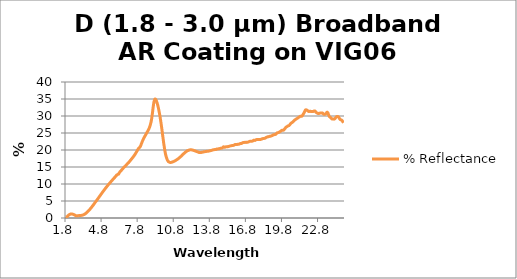
| Category | % Reflectance |
|---|---|
| 1.8 | 0.269 |
| 1.8045 | 0.246 |
| 1.809 | 0.23 |
| 1.8135 | 0.203 |
| 1.818 | 0.142 |
| 1.8225 | 0.19 |
| 1.827 | 0.202 |
| 1.8315 | 0.146 |
| 1.836 | 0.175 |
| 1.8405 | 0.157 |
| 1.845 | 0.162 |
| 1.8495 | 0.163 |
| 1.854 | 0.139 |
| 1.8585 | 0.137 |
| 1.863 | 0.177 |
| 1.8675 | 0.173 |
| 1.872 | 0.151 |
| 1.8765 | 0.161 |
| 1.881 | 0.18 |
| 1.8855 | 0.172 |
| 1.89 | 0.17 |
| 1.8945 | 0.207 |
| 1.899 | 0.196 |
| 1.9035 | 0.194 |
| 1.908 | 0.227 |
| 1.9125 | 0.238 |
| 1.917 | 0.249 |
| 1.9215 | 0.283 |
| 1.926 | 0.233 |
| 1.9305 | 0.287 |
| 1.935 | 0.289 |
| 1.9395 | 0.326 |
| 1.944 | 0.328 |
| 1.9485 | 0.32 |
| 1.953 | 0.35 |
| 1.9575 | 0.35 |
| 1.962 | 0.35 |
| 1.9665 | 0.393 |
| 1.971 | 0.374 |
| 1.9755 | 0.405 |
| 1.98 | 0.412 |
| 1.9845 | 0.457 |
| 1.989 | 0.466 |
| 1.9935 | 0.461 |
| 1.998 | 0.51 |
| 2.0025 | 0.484 |
| 2.007 | 0.537 |
| 2.0115 | 0.556 |
| 2.016 | 0.57 |
| 2.0205 | 0.574 |
| 2.025 | 0.58 |
| 2.0295 | 0.628 |
| 2.034 | 0.645 |
| 2.0385 | 0.635 |
| 2.043 | 0.642 |
| 2.0475 | 0.648 |
| 2.052 | 0.684 |
| 2.0565 | 0.692 |
| 2.061 | 0.726 |
| 2.0655 | 0.741 |
| 2.07 | 0.725 |
| 2.0745 | 0.766 |
| 2.079 | 0.773 |
| 2.0835 | 0.787 |
| 2.088 | 0.795 |
| 2.0925 | 0.802 |
| 2.097 | 0.839 |
| 2.1015 | 0.832 |
| 2.106 | 0.858 |
| 2.1105 | 0.875 |
| 2.115 | 0.866 |
| 2.1195 | 0.893 |
| 2.124 | 0.911 |
| 2.1285 | 0.929 |
| 2.133 | 0.931 |
| 2.1375 | 0.933 |
| 2.142 | 0.954 |
| 2.1465 | 0.954 |
| 2.151 | 0.953 |
| 2.1555 | 0.983 |
| 2.16 | 0.997 |
| 2.1645 | 1.018 |
| 2.169 | 1.021 |
| 2.1735 | 1.027 |
| 2.178 | 1.04 |
| 2.1825 | 1.035 |
| 2.187 | 1.06 |
| 2.1915 | 1.06 |
| 2.196 | 1.069 |
| 2.2005 | 1.071 |
| 2.205 | 1.08 |
| 2.2095 | 1.076 |
| 2.214 | 1.089 |
| 2.2185 | 1.103 |
| 2.223 | 1.116 |
| 2.2275 | 1.128 |
| 2.232 | 1.138 |
| 2.2365 | 1.13 |
| 2.241 | 1.118 |
| 2.2455 | 1.135 |
| 2.25 | 1.143 |
| 2.2545 | 1.139 |
| 2.259 | 1.137 |
| 2.2635 | 1.148 |
| 2.268 | 1.17 |
| 2.2725 | 1.159 |
| 2.277 | 1.155 |
| 2.2815 | 1.166 |
| 2.286 | 1.164 |
| 2.2905 | 1.173 |
| 2.295 | 1.177 |
| 2.2995 | 1.183 |
| 2.304 | 1.186 |
| 2.3085 | 1.184 |
| 2.313 | 1.175 |
| 2.3175 | 1.183 |
| 2.322 | 1.19 |
| 2.3265 | 1.188 |
| 2.331 | 1.188 |
| 2.3355 | 1.186 |
| 2.34 | 1.181 |
| 2.3445 | 1.183 |
| 2.349 | 1.182 |
| 2.3535 | 1.185 |
| 2.358 | 1.179 |
| 2.3625 | 1.179 |
| 2.367 | 1.175 |
| 2.3715 | 1.178 |
| 2.376 | 1.158 |
| 2.3805 | 1.167 |
| 2.385 | 1.166 |
| 2.3895 | 1.171 |
| 2.394 | 1.165 |
| 2.3985 | 1.16 |
| 2.403 | 1.154 |
| 2.4075 | 1.149 |
| 2.412 | 1.145 |
| 2.4165 | 1.146 |
| 2.421 | 1.149 |
| 2.4255 | 1.126 |
| 2.43 | 1.13 |
| 2.4345 | 1.121 |
| 2.439 | 1.124 |
| 2.4435 | 1.12 |
| 2.448 | 1.112 |
| 2.4525 | 1.113 |
| 2.457 | 1.104 |
| 2.4615 | 1.095 |
| 2.466 | 1.089 |
| 2.4705 | 1.094 |
| 2.475 | 1.081 |
| 2.4795 | 1.075 |
| 2.484 | 1.066 |
| 2.4885 | 1.076 |
| 2.493 | 1.063 |
| 2.4975 | 1.052 |
| 2.502 | 1.042 |
| 2.5065 | 1.043 |
| 2.511 | 1.039 |
| 2.5155 | 1.021 |
| 2.52 | 1.005 |
| 2.5245 | 1.019 |
| 2.529 | 1.015 |
| 2.5335 | 0.999 |
| 2.538 | 1.015 |
| 2.5425 | 0.996 |
| 2.547 | 0.977 |
| 2.5515 | 0.971 |
| 2.556 | 0.971 |
| 2.5605 | 0.956 |
| 2.565 | 0.952 |
| 2.5695 | 0.943 |
| 2.574 | 0.939 |
| 2.5785 | 0.927 |
| 2.583 | 0.921 |
| 2.5875 | 0.91 |
| 2.592 | 0.896 |
| 2.5965 | 0.89 |
| 2.601 | 0.893 |
| 2.6055 | 0.88 |
| 2.61 | 0.875 |
| 2.6145 | 0.853 |
| 2.619 | 0.838 |
| 2.6235 | 0.828 |
| 2.628 | 0.842 |
| 2.6325 | 0.832 |
| 2.637 | 0.806 |
| 2.6415 | 0.803 |
| 2.646 | 0.789 |
| 2.6505 | 0.782 |
| 2.655 | 0.78 |
| 2.6595 | 0.765 |
| 2.664 | 0.761 |
| 2.6685 | 0.748 |
| 2.673 | 0.737 |
| 2.6775 | 0.716 |
| 2.682 | 0.709 |
| 2.6865 | 0.704 |
| 2.691 | 0.694 |
| 2.6955 | 0.682 |
| 2.7 | 0.677 |
| 2.7045 | 0.663 |
| 2.709 | 0.652 |
| 2.7135 | 0.646 |
| 2.718 | 0.637 |
| 2.7225 | 0.653 |
| 2.727 | 0.647 |
| 2.7315 | 0.656 |
| 2.736 | 0.652 |
| 2.7405 | 0.66 |
| 2.745 | 0.666 |
| 2.7495 | 0.654 |
| 2.754 | 0.657 |
| 2.7585 | 0.674 |
| 2.763 | 0.662 |
| 2.7675 | 0.674 |
| 2.772 | 0.674 |
| 2.7765 | 0.658 |
| 2.781 | 0.665 |
| 2.7855 | 0.667 |
| 2.79 | 0.661 |
| 2.7945 | 0.662 |
| 2.799 | 0.665 |
| 2.8035 | 0.656 |
| 2.808 | 0.653 |
| 2.8125 | 0.655 |
| 2.817 | 0.653 |
| 2.8215 | 0.655 |
| 2.826 | 0.663 |
| 2.8305 | 0.656 |
| 2.835 | 0.653 |
| 2.8395 | 0.659 |
| 2.844 | 0.659 |
| 2.8485 | 0.665 |
| 2.853 | 0.662 |
| 2.8575 | 0.67 |
| 2.862 | 0.669 |
| 2.8665 | 0.667 |
| 2.871 | 0.679 |
| 2.8755 | 0.663 |
| 2.88 | 0.677 |
| 2.8845 | 0.678 |
| 2.889 | 0.686 |
| 2.8935 | 0.681 |
| 2.898 | 0.688 |
| 2.9025 | 0.683 |
| 2.907 | 0.688 |
| 2.9115 | 0.684 |
| 2.916 | 0.697 |
| 2.9205 | 0.693 |
| 2.925 | 0.694 |
| 2.9295 | 0.687 |
| 2.934 | 0.699 |
| 2.9385 | 0.702 |
| 2.943 | 0.698 |
| 2.9475 | 0.701 |
| 2.952 | 0.703 |
| 2.9565 | 0.704 |
| 2.961 | 0.695 |
| 2.9655 | 0.702 |
| 2.97 | 0.706 |
| 2.9745 | 0.707 |
| 2.979 | 0.705 |
| 2.9835 | 0.708 |
| 2.988 | 0.718 |
| 2.9925 | 0.717 |
| 2.997 | 0.704 |
| 3.0015 | 0.719 |
| 3.006 | 0.714 |
| 3.0105 | 0.717 |
| 3.015 | 0.715 |
| 3.0195 | 0.724 |
| 3.024 | 0.716 |
| 3.0285 | 0.716 |
| 3.033 | 0.72 |
| 3.0375 | 0.724 |
| 3.042 | 0.721 |
| 3.0465 | 0.724 |
| 3.051 | 0.734 |
| 3.0555 | 0.733 |
| 3.06 | 0.732 |
| 3.0645 | 0.736 |
| 3.069 | 0.737 |
| 3.0735 | 0.73 |
| 3.078 | 0.737 |
| 3.0825 | 0.739 |
| 3.087 | 0.743 |
| 3.0915 | 0.744 |
| 3.096 | 0.743 |
| 3.1005 | 0.754 |
| 3.105 | 0.748 |
| 3.1095 | 0.748 |
| 3.114 | 0.755 |
| 3.1185 | 0.756 |
| 3.123 | 0.761 |
| 3.1275 | 0.758 |
| 3.132 | 0.76 |
| 3.1365 | 0.76 |
| 3.141 | 0.764 |
| 3.1455 | 0.764 |
| 3.15 | 0.771 |
| 3.1545 | 0.769 |
| 3.159 | 0.774 |
| 3.1635 | 0.769 |
| 3.168 | 0.773 |
| 3.1725 | 0.769 |
| 3.177 | 0.786 |
| 3.1815 | 0.791 |
| 3.186 | 0.793 |
| 3.1905 | 0.793 |
| 3.195 | 0.8 |
| 3.1995 | 0.808 |
| 3.204 | 0.805 |
| 3.2085 | 0.809 |
| 3.213 | 0.81 |
| 3.2175 | 0.812 |
| 3.222 | 0.822 |
| 3.2265 | 0.819 |
| 3.231 | 0.828 |
| 3.2355 | 0.825 |
| 3.24 | 0.83 |
| 3.2445 | 0.837 |
| 3.249 | 0.839 |
| 3.2535 | 0.853 |
| 3.258 | 0.857 |
| 3.2625 | 0.857 |
| 3.267 | 0.858 |
| 3.2715 | 0.862 |
| 3.276 | 0.865 |
| 3.2805 | 0.878 |
| 3.285 | 0.886 |
| 3.2895 | 0.893 |
| 3.294 | 0.896 |
| 3.2985 | 0.904 |
| 3.303 | 0.906 |
| 3.3075 | 0.917 |
| 3.312 | 0.916 |
| 3.3165 | 0.927 |
| 3.321 | 0.933 |
| 3.3255 | 0.934 |
| 3.33 | 0.942 |
| 3.3345 | 0.946 |
| 3.339 | 0.955 |
| 3.3435 | 0.965 |
| 3.348 | 0.973 |
| 3.3525 | 0.985 |
| 3.357 | 0.989 |
| 3.3615 | 0.988 |
| 3.366 | 0.998 |
| 3.3705 | 1.014 |
| 3.375 | 1.014 |
| 3.3795 | 1.024 |
| 3.384 | 1.038 |
| 3.3885 | 1.041 |
| 3.393 | 1.056 |
| 3.3975 | 1.054 |
| 3.402 | 1.065 |
| 3.4065 | 1.073 |
| 3.411 | 1.075 |
| 3.4155 | 1.079 |
| 3.42 | 1.08 |
| 3.4245 | 1.089 |
| 3.429 | 1.092 |
| 3.4335 | 1.116 |
| 3.438 | 1.129 |
| 3.4425 | 1.148 |
| 3.447 | 1.163 |
| 3.4515 | 1.172 |
| 3.456 | 1.178 |
| 3.4605 | 1.188 |
| 3.465 | 1.201 |
| 3.4695 | 1.216 |
| 3.474 | 1.222 |
| 3.4785 | 1.241 |
| 3.483 | 1.256 |
| 3.4875 | 1.258 |
| 3.492 | 1.272 |
| 3.4965 | 1.281 |
| 3.501 | 1.286 |
| 3.5055 | 1.293 |
| 3.51 | 1.3 |
| 3.5145 | 1.318 |
| 3.519 | 1.342 |
| 3.5235 | 1.347 |
| 3.528 | 1.359 |
| 3.5325 | 1.385 |
| 3.537 | 1.392 |
| 3.5415 | 1.403 |
| 3.546 | 1.42 |
| 3.5505 | 1.426 |
| 3.555 | 1.441 |
| 3.5595 | 1.453 |
| 3.564 | 1.468 |
| 3.5685 | 1.484 |
| 3.573 | 1.499 |
| 3.5775 | 1.508 |
| 3.582 | 1.521 |
| 3.5865 | 1.533 |
| 3.591 | 1.551 |
| 3.5955 | 1.56 |
| 3.6 | 1.574 |
| 3.6045 | 1.592 |
| 3.609 | 1.606 |
| 3.6135 | 1.614 |
| 3.618 | 1.632 |
| 3.6225 | 1.647 |
| 3.627 | 1.665 |
| 3.6315 | 1.683 |
| 3.636 | 1.689 |
| 3.6405 | 1.701 |
| 3.645 | 1.722 |
| 3.6495 | 1.736 |
| 3.654 | 1.749 |
| 3.6585 | 1.769 |
| 3.663 | 1.788 |
| 3.6675 | 1.803 |
| 3.672 | 1.814 |
| 3.6765 | 1.829 |
| 3.681 | 1.846 |
| 3.6855 | 1.862 |
| 3.69 | 1.875 |
| 3.6945 | 1.895 |
| 3.699 | 1.905 |
| 3.7035 | 1.925 |
| 3.708 | 1.941 |
| 3.7125 | 1.954 |
| 3.717 | 1.973 |
| 3.7215 | 1.986 |
| 3.726 | 2.005 |
| 3.7305 | 2.022 |
| 3.735 | 2.036 |
| 3.7395 | 2.05 |
| 3.744 | 2.067 |
| 3.7485 | 2.085 |
| 3.753 | 2.103 |
| 3.7575 | 2.118 |
| 3.762 | 2.132 |
| 3.7665 | 2.156 |
| 3.771 | 2.181 |
| 3.7755 | 2.193 |
| 3.78 | 2.21 |
| 3.7845 | 2.231 |
| 3.789 | 2.246 |
| 3.7935 | 2.259 |
| 3.798 | 2.277 |
| 3.8025 | 2.289 |
| 3.807 | 2.307 |
| 3.8115 | 2.328 |
| 3.816 | 2.347 |
| 3.8205 | 2.367 |
| 3.825 | 2.387 |
| 3.8295 | 2.399 |
| 3.834 | 2.422 |
| 3.8385 | 2.445 |
| 3.843 | 2.461 |
| 3.8475 | 2.472 |
| 3.852 | 2.487 |
| 3.8565 | 2.509 |
| 3.861 | 2.53 |
| 3.8655 | 2.544 |
| 3.87 | 2.559 |
| 3.8745 | 2.576 |
| 3.879 | 2.6 |
| 3.8835 | 2.62 |
| 3.888 | 2.646 |
| 3.8925 | 2.662 |
| 3.897 | 2.675 |
| 3.9015 | 2.702 |
| 3.906 | 2.718 |
| 3.9105 | 2.736 |
| 3.915 | 2.755 |
| 3.9195 | 2.774 |
| 3.924 | 2.797 |
| 3.9285 | 2.816 |
| 3.933 | 2.838 |
| 3.9375 | 2.854 |
| 3.942 | 2.872 |
| 3.9465 | 2.892 |
| 3.951 | 2.912 |
| 3.9555 | 2.932 |
| 3.96 | 2.95 |
| 3.9645 | 2.967 |
| 3.969 | 2.986 |
| 3.9735 | 3.005 |
| 3.978 | 3.024 |
| 3.9825 | 3.048 |
| 3.987 | 3.068 |
| 3.9915 | 3.084 |
| 3.996 | 3.102 |
| 4.0005 | 3.128 |
| 4.005 | 3.154 |
| 4.0095 | 3.168 |
| 4.014 | 3.185 |
| 4.0185 | 3.202 |
| 4.023 | 3.225 |
| 4.0275 | 3.246 |
| 4.032 | 3.271 |
| 4.0365 | 3.284 |
| 4.041 | 3.305 |
| 4.0455 | 3.322 |
| 4.05 | 3.34 |
| 4.0545 | 3.368 |
| 4.059 | 3.39 |
| 4.0635 | 3.408 |
| 4.068 | 3.429 |
| 4.0725 | 3.451 |
| 4.077 | 3.469 |
| 4.0815 | 3.498 |
| 4.086 | 3.518 |
| 4.0905 | 3.532 |
| 4.095 | 3.552 |
| 4.0995 | 3.575 |
| 4.104 | 3.595 |
| 4.1085 | 3.618 |
| 4.113 | 3.641 |
| 4.1175 | 3.657 |
| 4.122 | 3.677 |
| 4.1265 | 3.7 |
| 4.131 | 3.725 |
| 4.1355 | 3.744 |
| 4.14 | 3.767 |
| 4.1445 | 3.783 |
| 4.149 | 3.8 |
| 4.1535 | 3.827 |
| 4.158 | 3.851 |
| 4.1625 | 3.874 |
| 4.167 | 3.893 |
| 4.1715 | 3.915 |
| 4.176 | 3.939 |
| 4.1805 | 3.955 |
| 4.185 | 3.972 |
| 4.1895 | 3.998 |
| 4.194 | 4.013 |
| 4.1985 | 4.039 |
| 4.203 | 4.075 |
| 4.2075 | 4.098 |
| 4.212 | 4.121 |
| 4.2165 | 4.155 |
| 4.221 | 4.158 |
| 4.2255 | 4.172 |
| 4.23 | 4.207 |
| 4.2345 | 4.221 |
| 4.239 | 4.236 |
| 4.2435 | 4.272 |
| 4.248 | 4.294 |
| 4.2525 | 4.316 |
| 4.257 | 4.338 |
| 4.2615 | 4.35 |
| 4.266 | 4.373 |
| 4.2705 | 4.407 |
| 4.275 | 4.437 |
| 4.2795 | 4.455 |
| 4.284 | 4.472 |
| 4.2885 | 4.499 |
| 4.293 | 4.514 |
| 4.2975 | 4.535 |
| 4.302 | 4.567 |
| 4.3065 | 4.581 |
| 4.311 | 4.604 |
| 4.3155 | 4.627 |
| 4.32 | 4.646 |
| 4.3245 | 4.668 |
| 4.329 | 4.689 |
| 4.3335 | 4.718 |
| 4.338 | 4.738 |
| 4.3425 | 4.757 |
| 4.347 | 4.777 |
| 4.3515 | 4.79 |
| 4.356 | 4.81 |
| 4.3605 | 4.829 |
| 4.365 | 4.85 |
| 4.3695 | 4.872 |
| 4.374 | 4.891 |
| 4.3785 | 4.908 |
| 4.383 | 4.933 |
| 4.3875 | 4.957 |
| 4.392 | 4.974 |
| 4.3965 | 5 |
| 4.401 | 5.026 |
| 4.4055 | 5.042 |
| 4.41 | 5.06 |
| 4.4145 | 5.086 |
| 4.419 | 5.112 |
| 4.4235 | 5.134 |
| 4.428 | 5.155 |
| 4.4325 | 5.177 |
| 4.437 | 5.203 |
| 4.4415 | 5.225 |
| 4.446 | 5.241 |
| 4.4505 | 5.263 |
| 4.455 | 5.289 |
| 4.4595 | 5.311 |
| 4.464 | 5.331 |
| 4.4685 | 5.355 |
| 4.473 | 5.375 |
| 4.4775 | 5.393 |
| 4.482 | 5.416 |
| 4.4865 | 5.441 |
| 4.491 | 5.459 |
| 4.4955 | 5.48 |
| 4.5 | 5.505 |
| 4.5045 | 5.529 |
| 4.509 | 5.548 |
| 4.5135 | 5.571 |
| 4.518 | 5.589 |
| 4.5225 | 5.609 |
| 4.527 | 5.635 |
| 4.5315 | 5.658 |
| 4.536 | 5.686 |
| 4.5405 | 5.712 |
| 4.545 | 5.733 |
| 4.5495 | 5.753 |
| 4.554 | 5.773 |
| 4.5585 | 5.791 |
| 4.563 | 5.81 |
| 4.5675 | 5.833 |
| 4.572 | 5.857 |
| 4.5765 | 5.879 |
| 4.581 | 5.9 |
| 4.5855 | 5.92 |
| 4.59 | 5.946 |
| 4.5945 | 5.973 |
| 4.599 | 5.998 |
| 4.6035 | 6.016 |
| 4.608 | 6.037 |
| 4.6125 | 6.061 |
| 4.617 | 6.08 |
| 4.6215 | 6.102 |
| 4.626 | 6.123 |
| 4.6305 | 6.149 |
| 4.635 | 6.173 |
| 4.6395 | 6.192 |
| 4.644 | 6.211 |
| 4.6485 | 6.235 |
| 4.653 | 6.256 |
| 4.6575 | 6.277 |
| 4.662 | 6.298 |
| 4.6665 | 6.323 |
| 4.671 | 6.348 |
| 4.6755 | 6.371 |
| 4.68 | 6.395 |
| 4.6845 | 6.42 |
| 4.689 | 6.44 |
| 4.6935 | 6.46 |
| 4.698 | 6.484 |
| 4.7025 | 6.508 |
| 4.707 | 6.531 |
| 4.7115 | 6.551 |
| 4.716 | 6.572 |
| 4.7205 | 6.597 |
| 4.725 | 6.617 |
| 4.7295 | 6.637 |
| 4.734 | 6.66 |
| 4.7385 | 6.681 |
| 4.743 | 6.702 |
| 4.7475 | 6.721 |
| 4.752 | 6.742 |
| 4.7565 | 6.77 |
| 4.761 | 6.797 |
| 4.7655 | 6.817 |
| 4.77 | 6.836 |
| 4.7745 | 6.861 |
| 4.779 | 6.884 |
| 4.7835 | 6.902 |
| 4.788 | 6.925 |
| 4.7925 | 6.948 |
| 4.797 | 6.969 |
| 4.8015 | 6.991 |
| 4.806 | 7.014 |
| 4.8105 | 7.04 |
| 4.815 | 7.061 |
| 4.8195 | 7.083 |
| 4.824 | 7.104 |
| 4.8285 | 7.124 |
| 4.833 | 7.146 |
| 4.8375 | 7.175 |
| 4.842 | 7.198 |
| 4.8465 | 7.219 |
| 4.851 | 7.24 |
| 4.8555 | 7.262 |
| 4.86 | 7.282 |
| 4.8645 | 7.304 |
| 4.869 | 7.326 |
| 4.8735 | 7.35 |
| 4.878 | 7.372 |
| 4.8825 | 7.396 |
| 4.887 | 7.421 |
| 4.8915 | 7.446 |
| 4.896 | 7.468 |
| 4.9005 | 7.49 |
| 4.905 | 7.512 |
| 4.9095 | 7.531 |
| 4.914 | 7.552 |
| 4.9185 | 7.575 |
| 4.923 | 7.598 |
| 4.9275 | 7.617 |
| 4.932 | 7.641 |
| 4.9365 | 7.663 |
| 4.941 | 7.686 |
| 4.9455 | 7.708 |
| 4.95 | 7.729 |
| 4.9545 | 7.75 |
| 4.959 | 7.772 |
| 4.9635 | 7.794 |
| 4.968 | 7.816 |
| 4.9725 | 7.837 |
| 4.977 | 7.856 |
| 4.9815 | 7.879 |
| 4.986 | 7.899 |
| 4.9905 | 7.917 |
| 4.995 | 7.936 |
| 4.9995 | 7.961 |
| 5.004 | 7.984 |
| 5.0085 | 8.001 |
| 5.013 | 8.016 |
| 5.0175 | 8.039 |
| 5.022 | 8.069 |
| 5.0265 | 8.093 |
| 5.031 | 8.113 |
| 5.0355 | 8.133 |
| 5.04 | 8.155 |
| 5.0445 | 8.175 |
| 5.049 | 8.199 |
| 5.0535 | 8.223 |
| 5.058 | 8.243 |
| 5.0625 | 8.262 |
| 5.067 | 8.281 |
| 5.0715 | 8.301 |
| 5.076 | 8.319 |
| 5.0805 | 8.339 |
| 5.085 | 8.36 |
| 5.0895 | 8.38 |
| 5.094 | 8.402 |
| 5.0985 | 8.424 |
| 5.103 | 8.448 |
| 5.1075 | 8.469 |
| 5.112 | 8.489 |
| 5.1165 | 8.507 |
| 5.121 | 8.523 |
| 5.1255 | 8.543 |
| 5.13 | 8.568 |
| 5.1345 | 8.595 |
| 5.139 | 8.618 |
| 5.1435 | 8.639 |
| 5.148 | 8.655 |
| 5.1525 | 8.672 |
| 5.157 | 8.691 |
| 5.1615 | 8.709 |
| 5.166 | 8.727 |
| 5.1705 | 8.747 |
| 5.175 | 8.77 |
| 5.1795 | 8.792 |
| 5.184 | 8.815 |
| 5.1885 | 8.839 |
| 5.193 | 8.857 |
| 5.1975 | 8.877 |
| 5.202 | 8.897 |
| 5.2065 | 8.92 |
| 5.211 | 8.944 |
| 5.2155 | 8.964 |
| 5.22 | 8.984 |
| 5.2245 | 9.005 |
| 5.229 | 9.024 |
| 5.2335 | 9.042 |
| 5.238 | 9.06 |
| 5.2425 | 9.081 |
| 5.247 | 9.104 |
| 5.2515 | 9.127 |
| 5.256 | 9.147 |
| 5.2605 | 9.166 |
| 5.265 | 9.188 |
| 5.2695 | 9.212 |
| 5.274 | 9.234 |
| 5.2785 | 9.253 |
| 5.283 | 9.271 |
| 5.2875 | 9.289 |
| 5.292 | 9.308 |
| 5.2965 | 9.328 |
| 5.301 | 9.348 |
| 5.3055 | 9.371 |
| 5.31 | 9.392 |
| 5.3145 | 9.406 |
| 5.319 | 9.422 |
| 5.3235 | 9.445 |
| 5.328 | 9.469 |
| 5.3325 | 9.489 |
| 5.337 | 9.504 |
| 5.3415 | 9.523 |
| 5.346 | 9.544 |
| 5.3505 | 9.566 |
| 5.355 | 9.582 |
| 5.3595 | 9.597 |
| 5.364 | 9.622 |
| 5.3685 | 9.647 |
| 5.373 | 9.664 |
| 5.3775 | 9.679 |
| 5.382 | 9.695 |
| 5.3865 | 9.713 |
| 5.391 | 9.73 |
| 5.3955 | 9.747 |
| 5.4 | 9.768 |
| 5.4045 | 9.789 |
| 5.409 | 9.812 |
| 5.4135 | 9.835 |
| 5.418 | 9.85 |
| 5.4225 | 9.863 |
| 5.427 | 9.877 |
| 5.4315 | 9.898 |
| 5.436 | 9.922 |
| 5.4405 | 9.94 |
| 5.445 | 9.956 |
| 5.4495 | 9.974 |
| 5.454 | 9.995 |
| 5.4585 | 10.017 |
| 5.463 | 10.035 |
| 5.4675 | 10.049 |
| 5.472 | 10.069 |
| 5.4765 | 10.091 |
| 5.481 | 10.11 |
| 5.4855 | 10.126 |
| 5.49 | 10.143 |
| 5.4945 | 10.163 |
| 5.499 | 10.184 |
| 5.5035 | 10.201 |
| 5.508 | 10.215 |
| 5.5125 | 10.229 |
| 5.517 | 10.246 |
| 5.5215 | 10.263 |
| 5.526 | 10.28 |
| 5.5305 | 10.302 |
| 5.535 | 10.323 |
| 5.5395 | 10.343 |
| 5.544 | 10.361 |
| 5.5485 | 10.378 |
| 5.553 | 10.397 |
| 5.5575 | 10.418 |
| 5.562 | 10.436 |
| 5.5665 | 10.453 |
| 5.571 | 10.472 |
| 5.5755 | 10.489 |
| 5.58 | 10.509 |
| 5.5845 | 10.531 |
| 5.589 | 10.551 |
| 5.5935 | 10.572 |
| 5.598 | 10.59 |
| 5.6025 | 10.604 |
| 5.607 | 10.617 |
| 5.6115 | 10.635 |
| 5.616 | 10.658 |
| 5.6205 | 10.68 |
| 5.625 | 10.7 |
| 5.6295 | 10.723 |
| 5.634 | 10.744 |
| 5.6385 | 10.76 |
| 5.643 | 10.774 |
| 5.6475 | 10.788 |
| 5.652 | 10.806 |
| 5.6565 | 10.826 |
| 5.661 | 10.845 |
| 5.6655 | 10.867 |
| 5.67 | 10.89 |
| 5.6745 | 10.91 |
| 5.679 | 10.924 |
| 5.6835 | 10.938 |
| 5.688 | 10.953 |
| 5.6925 | 10.973 |
| 5.697 | 10.995 |
| 5.7015 | 11.015 |
| 5.706 | 11.036 |
| 5.7105 | 11.059 |
| 5.715 | 11.078 |
| 5.7195 | 11.093 |
| 5.724 | 11.106 |
| 5.7285 | 11.121 |
| 5.733 | 11.138 |
| 5.7375 | 11.155 |
| 5.742 | 11.173 |
| 5.7465 | 11.194 |
| 5.751 | 11.214 |
| 5.7555 | 11.232 |
| 5.76 | 11.251 |
| 5.7645 | 11.268 |
| 5.769 | 11.284 |
| 5.7735 | 11.304 |
| 5.778 | 11.323 |
| 5.7825 | 11.341 |
| 5.787 | 11.36 |
| 5.7915 | 11.38 |
| 5.796 | 11.399 |
| 5.8005 | 11.419 |
| 5.805 | 11.437 |
| 5.8095 | 11.456 |
| 5.814 | 11.479 |
| 5.8185 | 11.501 |
| 5.823 | 11.516 |
| 5.8275 | 11.527 |
| 5.832 | 11.54 |
| 5.8365 | 11.56 |
| 5.841 | 11.583 |
| 5.8455 | 11.601 |
| 5.85 | 11.617 |
| 5.8545 | 11.636 |
| 5.859 | 11.655 |
| 5.8635 | 11.67 |
| 5.868 | 11.685 |
| 5.8725 | 11.7 |
| 5.877 | 11.713 |
| 5.8815 | 11.731 |
| 5.886 | 11.751 |
| 5.8905 | 11.769 |
| 5.895 | 11.788 |
| 5.8995 | 11.81 |
| 5.904 | 11.831 |
| 5.9085 | 11.852 |
| 5.913 | 11.87 |
| 5.9175 | 11.886 |
| 5.922 | 11.904 |
| 5.9265 | 11.92 |
| 5.931 | 11.928 |
| 5.9355 | 11.932 |
| 5.94 | 11.942 |
| 5.9445 | 11.966 |
| 5.949 | 11.995 |
| 5.9535 | 12.018 |
| 5.958 | 12.037 |
| 5.9625 | 12.056 |
| 5.967 | 12.079 |
| 5.9715 | 12.099 |
| 5.976 | 12.116 |
| 5.9805 | 12.132 |
| 5.985 | 12.147 |
| 5.9895 | 12.164 |
| 5.994 | 12.187 |
| 5.9985 | 12.207 |
| 6.003 | 12.224 |
| 6.0075 | 12.24 |
| 6.012 | 12.257 |
| 6.0165 | 12.273 |
| 6.021 | 12.29 |
| 6.0255 | 12.309 |
| 6.03 | 12.329 |
| 6.0345 | 12.352 |
| 6.039 | 12.375 |
| 6.0435 | 12.388 |
| 6.048 | 12.394 |
| 6.0525 | 12.409 |
| 6.057 | 12.435 |
| 6.0615 | 12.465 |
| 6.066 | 12.488 |
| 6.0705 | 12.502 |
| 6.075 | 12.513 |
| 6.0795 | 12.529 |
| 6.084 | 12.547 |
| 6.0885 | 12.563 |
| 6.093 | 12.579 |
| 6.0975 | 12.597 |
| 6.102 | 12.614 |
| 6.1065 | 12.629 |
| 6.111 | 12.641 |
| 6.1155 | 12.65 |
| 6.12 | 12.659 |
| 6.1245 | 12.673 |
| 6.129 | 12.686 |
| 6.1335 | 12.694 |
| 6.138 | 12.698 |
| 6.1425 | 12.703 |
| 6.147 | 12.705 |
| 6.1515 | 12.709 |
| 6.156 | 12.719 |
| 6.1605 | 12.735 |
| 6.165 | 12.755 |
| 6.1695 | 12.776 |
| 6.174 | 12.792 |
| 6.1785 | 12.803 |
| 6.183 | 12.813 |
| 6.1875 | 12.828 |
| 6.192 | 12.844 |
| 6.1965 | 12.857 |
| 6.201 | 12.87 |
| 6.2055 | 12.88 |
| 6.21 | 12.887 |
| 6.2145 | 12.893 |
| 6.219 | 12.901 |
| 6.2235 | 12.909 |
| 6.228 | 12.918 |
| 6.2325 | 12.927 |
| 6.237 | 12.933 |
| 6.2415 | 12.933 |
| 6.246 | 12.928 |
| 6.2505 | 12.917 |
| 6.255 | 12.904 |
| 6.2595 | 12.897 |
| 6.264 | 12.907 |
| 6.2685 | 12.936 |
| 6.273 | 12.979 |
| 6.2775 | 13.029 |
| 6.282 | 13.081 |
| 6.2865 | 13.127 |
| 6.291 | 13.167 |
| 6.2955 | 13.202 |
| 6.3 | 13.232 |
| 6.3045 | 13.258 |
| 6.309 | 13.282 |
| 6.3135 | 13.306 |
| 6.318 | 13.327 |
| 6.3225 | 13.347 |
| 6.327 | 13.368 |
| 6.3315 | 13.39 |
| 6.336 | 13.41 |
| 6.3405 | 13.429 |
| 6.345 | 13.451 |
| 6.3495 | 13.47 |
| 6.354 | 13.488 |
| 6.3585 | 13.508 |
| 6.363 | 13.527 |
| 6.3675 | 13.546 |
| 6.372 | 13.566 |
| 6.3765 | 13.586 |
| 6.381 | 13.604 |
| 6.3855 | 13.62 |
| 6.39 | 13.636 |
| 6.3945 | 13.655 |
| 6.399 | 13.674 |
| 6.4035 | 13.69 |
| 6.408 | 13.703 |
| 6.4125 | 13.72 |
| 6.417 | 13.738 |
| 6.4215 | 13.757 |
| 6.426 | 13.777 |
| 6.4305 | 13.795 |
| 6.435 | 13.812 |
| 6.4395 | 13.833 |
| 6.444 | 13.857 |
| 6.4485 | 13.879 |
| 6.453 | 13.899 |
| 6.4575 | 13.917 |
| 6.462 | 13.932 |
| 6.4665 | 13.946 |
| 6.471 | 13.961 |
| 6.4755 | 13.98 |
| 6.48 | 14.001 |
| 6.4845 | 14.019 |
| 6.489 | 14.036 |
| 6.4935 | 14.055 |
| 6.498 | 14.073 |
| 6.5025 | 14.093 |
| 6.507 | 14.119 |
| 6.5115 | 14.145 |
| 6.516 | 14.165 |
| 6.5205 | 14.179 |
| 6.525 | 14.192 |
| 6.5295 | 14.205 |
| 6.534 | 14.218 |
| 6.5385 | 14.233 |
| 6.543 | 14.25 |
| 6.5475 | 14.269 |
| 6.552 | 14.289 |
| 6.5565 | 14.311 |
| 6.561 | 14.335 |
| 6.5655 | 14.359 |
| 6.57 | 14.381 |
| 6.5745 | 14.4 |
| 6.579 | 14.414 |
| 6.5835 | 14.424 |
| 6.588 | 14.438 |
| 6.5925 | 14.459 |
| 6.597 | 14.484 |
| 6.6015 | 14.504 |
| 6.606 | 14.519 |
| 6.6105 | 14.534 |
| 6.615 | 14.552 |
| 6.6195 | 14.571 |
| 6.624 | 14.589 |
| 6.6285 | 14.608 |
| 6.633 | 14.631 |
| 6.6375 | 14.653 |
| 6.642 | 14.669 |
| 6.6465 | 14.683 |
| 6.651 | 14.698 |
| 6.6555 | 14.713 |
| 6.66 | 14.728 |
| 6.6645 | 14.745 |
| 6.669 | 14.766 |
| 6.6735 | 14.786 |
| 6.678 | 14.807 |
| 6.6825 | 14.827 |
| 6.687 | 14.846 |
| 6.6915 | 14.861 |
| 6.696 | 14.876 |
| 6.7005 | 14.891 |
| 6.705 | 14.906 |
| 6.7095 | 14.921 |
| 6.714 | 14.938 |
| 6.7185 | 14.957 |
| 6.723 | 14.973 |
| 6.7275 | 14.986 |
| 6.732 | 14.999 |
| 6.7365 | 15.014 |
| 6.741 | 15.029 |
| 6.7455 | 15.044 |
| 6.75 | 15.058 |
| 6.7545 | 15.072 |
| 6.759 | 15.087 |
| 6.7635 | 15.102 |
| 6.768 | 15.119 |
| 6.7725 | 15.138 |
| 6.777 | 15.153 |
| 6.7815 | 15.162 |
| 6.786 | 15.167 |
| 6.7905 | 15.174 |
| 6.795 | 15.183 |
| 6.7995 | 15.195 |
| 6.804 | 15.209 |
| 6.8085 | 15.225 |
| 6.813 | 15.243 |
| 6.8175 | 15.259 |
| 6.822 | 15.276 |
| 6.8265 | 15.296 |
| 6.831 | 15.317 |
| 6.8355 | 15.338 |
| 6.84 | 15.36 |
| 6.8445 | 15.382 |
| 6.849 | 15.403 |
| 6.8535 | 15.42 |
| 6.858 | 15.434 |
| 6.8625 | 15.451 |
| 6.867 | 15.474 |
| 6.8715 | 15.496 |
| 6.876 | 15.513 |
| 6.8805 | 15.529 |
| 6.885 | 15.546 |
| 6.8895 | 15.564 |
| 6.894 | 15.582 |
| 6.8985 | 15.599 |
| 6.903 | 15.616 |
| 6.9075 | 15.634 |
| 6.912 | 15.649 |
| 6.9165 | 15.663 |
| 6.921 | 15.68 |
| 6.9255 | 15.699 |
| 6.93 | 15.718 |
| 6.9345 | 15.737 |
| 6.939 | 15.755 |
| 6.9435 | 15.773 |
| 6.948 | 15.789 |
| 6.9525 | 15.804 |
| 6.957 | 15.82 |
| 6.9615 | 15.84 |
| 6.966 | 15.86 |
| 6.9705 | 15.877 |
| 6.975 | 15.893 |
| 6.9795 | 15.911 |
| 6.984 | 15.933 |
| 6.9885 | 15.955 |
| 6.993 | 15.975 |
| 6.9975 | 15.994 |
| 7.002 | 16.01 |
| 7.0065 | 16.025 |
| 7.011 | 16.04 |
| 7.0155 | 16.058 |
| 7.02 | 16.078 |
| 7.0245 | 16.097 |
| 7.029 | 16.112 |
| 7.0335 | 16.124 |
| 7.038 | 16.138 |
| 7.0425 | 16.155 |
| 7.047 | 16.171 |
| 7.0515 | 16.186 |
| 7.056 | 16.199 |
| 7.0605 | 16.212 |
| 7.065 | 16.224 |
| 7.0695 | 16.234 |
| 7.074 | 16.244 |
| 7.0785 | 16.258 |
| 7.083 | 16.276 |
| 7.0875 | 16.294 |
| 7.092 | 16.312 |
| 7.0965 | 16.33 |
| 7.101 | 16.35 |
| 7.1055 | 16.371 |
| 7.11 | 16.392 |
| 7.1145 | 16.414 |
| 7.119 | 16.436 |
| 7.1235 | 16.455 |
| 7.128 | 16.471 |
| 7.1325 | 16.486 |
| 7.137 | 16.5 |
| 7.1415 | 16.517 |
| 7.146 | 16.533 |
| 7.1505 | 16.548 |
| 7.155 | 16.562 |
| 7.1595 | 16.579 |
| 7.164 | 16.599 |
| 7.1685 | 16.618 |
| 7.173 | 16.636 |
| 7.1775 | 16.654 |
| 7.182 | 16.673 |
| 7.1865 | 16.693 |
| 7.191 | 16.714 |
| 7.1955 | 16.736 |
| 7.2 | 16.762 |
| 7.2045 | 16.788 |
| 7.209 | 16.81 |
| 7.2135 | 16.829 |
| 7.218 | 16.845 |
| 7.2225 | 16.863 |
| 7.227 | 16.885 |
| 7.2315 | 16.906 |
| 7.236 | 16.927 |
| 7.2405 | 16.948 |
| 7.245 | 16.97 |
| 7.2495 | 16.991 |
| 7.254 | 17.012 |
| 7.2585 | 17.031 |
| 7.263 | 17.053 |
| 7.2675 | 17.076 |
| 7.272 | 17.098 |
| 7.2765 | 17.117 |
| 7.281 | 17.134 |
| 7.2855 | 17.152 |
| 7.29 | 17.17 |
| 7.2945 | 17.188 |
| 7.299 | 17.205 |
| 7.3035 | 17.222 |
| 7.308 | 17.241 |
| 7.3125 | 17.262 |
| 7.317 | 17.284 |
| 7.3215 | 17.306 |
| 7.326 | 17.329 |
| 7.3305 | 17.352 |
| 7.335 | 17.373 |
| 7.3395 | 17.391 |
| 7.344 | 17.409 |
| 7.3485 | 17.427 |
| 7.353 | 17.448 |
| 7.3575 | 17.468 |
| 7.362 | 17.488 |
| 7.3665 | 17.507 |
| 7.371 | 17.528 |
| 7.3755 | 17.548 |
| 7.38 | 17.568 |
| 7.3845 | 17.586 |
| 7.389 | 17.604 |
| 7.3935 | 17.622 |
| 7.398 | 17.64 |
| 7.4025 | 17.657 |
| 7.407 | 17.675 |
| 7.4115 | 17.694 |
| 7.416 | 17.717 |
| 7.4205 | 17.741 |
| 7.425 | 17.764 |
| 7.4295 | 17.786 |
| 7.434 | 17.806 |
| 7.4385 | 17.825 |
| 7.443 | 17.843 |
| 7.4475 | 17.859 |
| 7.452 | 17.876 |
| 7.4565 | 17.896 |
| 7.461 | 17.918 |
| 7.4655 | 17.943 |
| 7.47 | 17.966 |
| 7.4745 | 17.989 |
| 7.479 | 18.011 |
| 7.4835 | 18.032 |
| 7.488 | 18.053 |
| 7.4925 | 18.071 |
| 7.497 | 18.089 |
| 7.5015 | 18.108 |
| 7.506 | 18.128 |
| 7.5105 | 18.15 |
| 7.515 | 18.171 |
| 7.5195 | 18.192 |
| 7.524 | 18.214 |
| 7.5285 | 18.236 |
| 7.533 | 18.259 |
| 7.5375 | 18.283 |
| 7.542 | 18.307 |
| 7.5465 | 18.333 |
| 7.551 | 18.359 |
| 7.5555 | 18.383 |
| 7.56 | 18.403 |
| 7.5645 | 18.421 |
| 7.569 | 18.439 |
| 7.5735 | 18.461 |
| 7.578 | 18.485 |
| 7.5825 | 18.508 |
| 7.587 | 18.531 |
| 7.5915 | 18.553 |
| 7.596 | 18.577 |
| 7.6005 | 18.601 |
| 7.605 | 18.627 |
| 7.6095 | 18.653 |
| 7.614 | 18.679 |
| 7.6185 | 18.707 |
| 7.623 | 18.733 |
| 7.6275 | 18.758 |
| 7.632 | 18.782 |
| 7.6365 | 18.806 |
| 7.641 | 18.834 |
| 7.6455 | 18.862 |
| 7.65 | 18.888 |
| 7.6545 | 18.913 |
| 7.659 | 18.936 |
| 7.6635 | 18.96 |
| 7.668 | 18.986 |
| 7.6725 | 19.012 |
| 7.677 | 19.037 |
| 7.6815 | 19.061 |
| 7.686 | 19.087 |
| 7.6905 | 19.113 |
| 7.695 | 19.139 |
| 7.6995 | 19.165 |
| 7.704 | 19.191 |
| 7.7085 | 19.218 |
| 7.713 | 19.247 |
| 7.7175 | 19.275 |
| 7.722 | 19.302 |
| 7.7265 | 19.329 |
| 7.731 | 19.356 |
| 7.7355 | 19.385 |
| 7.74 | 19.416 |
| 7.7445 | 19.446 |
| 7.749 | 19.474 |
| 7.7535 | 19.501 |
| 7.758 | 19.528 |
| 7.7625 | 19.555 |
| 7.767 | 19.581 |
| 7.7715 | 19.605 |
| 7.776 | 19.629 |
| 7.7805 | 19.653 |
| 7.785 | 19.679 |
| 7.7895 | 19.707 |
| 7.794 | 19.735 |
| 7.7985 | 19.763 |
| 7.803 | 19.792 |
| 7.8075 | 19.824 |
| 7.812 | 19.857 |
| 7.8165 | 19.889 |
| 7.821 | 19.92 |
| 7.8255 | 19.95 |
| 7.83 | 19.978 |
| 7.8345 | 20.005 |
| 7.839 | 20.032 |
| 7.8435 | 20.056 |
| 7.848 | 20.081 |
| 7.8525 | 20.106 |
| 7.857 | 20.134 |
| 7.8615 | 20.162 |
| 7.866 | 20.19 |
| 7.8705 | 20.216 |
| 7.875 | 20.241 |
| 7.8795 | 20.267 |
| 7.884 | 20.293 |
| 7.8885 | 20.319 |
| 7.893 | 20.342 |
| 7.8975 | 20.364 |
| 7.902 | 20.385 |
| 7.9065 | 20.407 |
| 7.911 | 20.431 |
| 7.9155 | 20.456 |
| 7.92 | 20.479 |
| 7.9245 | 20.502 |
| 7.929 | 20.524 |
| 7.9335 | 20.545 |
| 7.938 | 20.565 |
| 7.9425 | 20.581 |
| 7.947 | 20.595 |
| 7.9515 | 20.608 |
| 7.956 | 20.625 |
| 7.9605 | 20.644 |
| 7.965 | 20.664 |
| 7.9695 | 20.682 |
| 7.974 | 20.697 |
| 7.9785 | 20.709 |
| 7.983 | 20.719 |
| 7.9875 | 20.728 |
| 7.992 | 20.737 |
| 7.9965 | 20.747 |
| 8.001 | 20.758 |
| 8.0055 | 20.773 |
| 8.01 | 20.791 |
| 8.0145 | 20.811 |
| 8.019 | 20.831 |
| 8.0235 | 20.851 |
| 8.028 | 20.871 |
| 8.0325 | 20.894 |
| 8.037 | 20.917 |
| 8.0415 | 20.941 |
| 8.046 | 20.965 |
| 8.0505 | 20.989 |
| 8.055 | 21.013 |
| 8.0595 | 21.039 |
| 8.064 | 21.067 |
| 8.0685 | 21.095 |
| 8.073 | 21.122 |
| 8.0775 | 21.151 |
| 8.082 | 21.182 |
| 8.0865 | 21.217 |
| 8.091 | 21.255 |
| 8.0955 | 21.293 |
| 8.1 | 21.331 |
| 8.1045 | 21.369 |
| 8.109 | 21.408 |
| 8.1135 | 21.448 |
| 8.118 | 21.491 |
| 8.1225 | 21.534 |
| 8.127 | 21.577 |
| 8.1315 | 21.62 |
| 8.136 | 21.664 |
| 8.1405 | 21.709 |
| 8.145 | 21.753 |
| 8.1495 | 21.796 |
| 8.154 | 21.838 |
| 8.1585 | 21.88 |
| 8.163 | 21.922 |
| 8.1675 | 21.965 |
| 8.172 | 22.006 |
| 8.1765 | 22.045 |
| 8.181 | 22.083 |
| 8.1855 | 22.119 |
| 8.19 | 22.158 |
| 8.1945 | 22.198 |
| 8.199 | 22.24 |
| 8.2035 | 22.28 |
| 8.208 | 22.32 |
| 8.2125 | 22.36 |
| 8.217 | 22.402 |
| 8.2215 | 22.445 |
| 8.226 | 22.489 |
| 8.2305 | 22.531 |
| 8.235 | 22.569 |
| 8.2395 | 22.604 |
| 8.244 | 22.64 |
| 8.2485 | 22.677 |
| 8.253 | 22.717 |
| 8.2575 | 22.758 |
| 8.262 | 22.801 |
| 8.2665 | 22.844 |
| 8.271 | 22.885 |
| 8.2755 | 22.924 |
| 8.28 | 22.957 |
| 8.2845 | 22.987 |
| 8.289 | 23.014 |
| 8.2935 | 23.041 |
| 8.298 | 23.071 |
| 8.3025 | 23.103 |
| 8.307 | 23.138 |
| 8.3115 | 23.172 |
| 8.316 | 23.207 |
| 8.3205 | 23.243 |
| 8.325 | 23.281 |
| 8.3295 | 23.319 |
| 8.334 | 23.358 |
| 8.3385 | 23.394 |
| 8.343 | 23.427 |
| 8.3475 | 23.457 |
| 8.352 | 23.486 |
| 8.3565 | 23.514 |
| 8.361 | 23.542 |
| 8.3655 | 23.569 |
| 8.37 | 23.594 |
| 8.3745 | 23.618 |
| 8.379 | 23.643 |
| 8.3835 | 23.671 |
| 8.388 | 23.701 |
| 8.3925 | 23.732 |
| 8.397 | 23.762 |
| 8.4015 | 23.792 |
| 8.406 | 23.823 |
| 8.4105 | 23.856 |
| 8.415 | 23.89 |
| 8.4195 | 23.924 |
| 8.424 | 23.956 |
| 8.4285 | 23.985 |
| 8.433 | 24.013 |
| 8.4375 | 24.04 |
| 8.442 | 24.068 |
| 8.4465 | 24.095 |
| 8.451 | 24.122 |
| 8.4555 | 24.146 |
| 8.46 | 24.171 |
| 8.4645 | 24.196 |
| 8.469 | 24.224 |
| 8.4735 | 24.253 |
| 8.478 | 24.283 |
| 8.4825 | 24.311 |
| 8.487 | 24.34 |
| 8.4915 | 24.37 |
| 8.496 | 24.4 |
| 8.5005 | 24.431 |
| 8.505 | 24.46 |
| 8.5095 | 24.487 |
| 8.514 | 24.511 |
| 8.5185 | 24.534 |
| 8.523 | 24.558 |
| 8.5275 | 24.585 |
| 8.532 | 24.614 |
| 8.5365 | 24.644 |
| 8.541 | 24.672 |
| 8.5455 | 24.699 |
| 8.55 | 24.726 |
| 8.5545 | 24.752 |
| 8.559 | 24.779 |
| 8.5635 | 24.804 |
| 8.568 | 24.829 |
| 8.5725 | 24.853 |
| 8.577 | 24.879 |
| 8.5815 | 24.907 |
| 8.586 | 24.937 |
| 8.5905 | 24.969 |
| 8.595 | 25 |
| 8.5995 | 25.028 |
| 8.604 | 25.056 |
| 8.6085 | 25.083 |
| 8.613 | 25.113 |
| 8.6175 | 25.145 |
| 8.622 | 25.179 |
| 8.6265 | 25.211 |
| 8.631 | 25.243 |
| 8.6355 | 25.273 |
| 8.64 | 25.303 |
| 8.6445 | 25.334 |
| 8.649 | 25.364 |
| 8.6535 | 25.393 |
| 8.658 | 25.419 |
| 8.6625 | 25.444 |
| 8.667 | 25.468 |
| 8.6715 | 25.493 |
| 8.676 | 25.518 |
| 8.6805 | 25.545 |
| 8.685 | 25.573 |
| 8.6895 | 25.6 |
| 8.694 | 25.63 |
| 8.6985 | 25.662 |
| 8.703 | 25.697 |
| 8.7075 | 25.733 |
| 8.712 | 25.768 |
| 8.7165 | 25.798 |
| 8.721 | 25.825 |
| 8.7255 | 25.849 |
| 8.73 | 25.875 |
| 8.7345 | 25.904 |
| 8.739 | 25.936 |
| 8.7435 | 25.972 |
| 8.748 | 26.007 |
| 8.7525 | 26.042 |
| 8.757 | 26.076 |
| 8.7615 | 26.109 |
| 8.766 | 26.143 |
| 8.7705 | 26.177 |
| 8.775 | 26.211 |
| 8.7795 | 26.243 |
| 8.784 | 26.277 |
| 8.7885 | 26.311 |
| 8.793 | 26.348 |
| 8.7975 | 26.389 |
| 8.802 | 26.432 |
| 8.8065 | 26.476 |
| 8.811 | 26.518 |
| 8.8155 | 26.56 |
| 8.82 | 26.602 |
| 8.8245 | 26.644 |
| 8.829 | 26.687 |
| 8.8335 | 26.729 |
| 8.838 | 26.771 |
| 8.8425 | 26.81 |
| 8.847 | 26.85 |
| 8.8515 | 26.892 |
| 8.856 | 26.939 |
| 8.8605 | 26.991 |
| 8.865 | 27.046 |
| 8.8695 | 27.103 |
| 8.874 | 27.16 |
| 8.8785 | 27.215 |
| 8.883 | 27.269 |
| 8.8875 | 27.324 |
| 8.892 | 27.379 |
| 8.8965 | 27.436 |
| 8.901 | 27.494 |
| 8.9055 | 27.552 |
| 8.91 | 27.61 |
| 8.9145 | 27.67 |
| 8.919 | 27.732 |
| 8.9235 | 27.794 |
| 8.928 | 27.854 |
| 8.9325 | 27.914 |
| 8.937 | 27.97 |
| 8.9415 | 28.029 |
| 8.946 | 28.092 |
| 8.9505 | 28.162 |
| 8.955 | 28.24 |
| 8.9595 | 28.323 |
| 8.964 | 28.41 |
| 8.9685 | 28.495 |
| 8.973 | 28.578 |
| 8.9775 | 28.659 |
| 8.982 | 28.741 |
| 8.9865 | 28.824 |
| 8.991 | 28.911 |
| 8.9955 | 29 |
| 9.0 | 29.091 |
| 9.0045 | 29.185 |
| 9.009 | 29.281 |
| 9.0135 | 29.382 |
| 9.018 | 29.487 |
| 9.0225 | 29.594 |
| 9.027 | 29.704 |
| 9.0315 | 29.812 |
| 9.036 | 29.92 |
| 9.0405 | 30.03 |
| 9.045 | 30.142 |
| 9.0495 | 30.26 |
| 9.054 | 30.382 |
| 9.0585 | 30.507 |
| 9.063 | 30.633 |
| 9.0675 | 30.758 |
| 9.072 | 30.882 |
| 9.0765 | 31.007 |
| 9.081 | 31.135 |
| 9.0855 | 31.266 |
| 9.09 | 31.401 |
| 9.0945 | 31.539 |
| 9.099 | 31.676 |
| 9.1035 | 31.813 |
| 9.108 | 31.95 |
| 9.1125 | 32.088 |
| 9.117 | 32.225 |
| 9.1215 | 32.359 |
| 9.126 | 32.49 |
| 9.1305 | 32.612 |
| 9.135 | 32.729 |
| 9.1395 | 32.841 |
| 9.144 | 32.952 |
| 9.1485 | 33.066 |
| 9.153 | 33.181 |
| 9.1575 | 33.297 |
| 9.162 | 33.409 |
| 9.1665 | 33.515 |
| 9.171 | 33.615 |
| 9.1755 | 33.708 |
| 9.18 | 33.798 |
| 9.1845 | 33.886 |
| 9.189 | 33.971 |
| 9.1935 | 34.052 |
| 9.198 | 34.128 |
| 9.2025 | 34.2 |
| 9.207 | 34.267 |
| 9.2115 | 34.332 |
| 9.216 | 34.397 |
| 9.2205 | 34.46 |
| 9.225 | 34.519 |
| 9.2295 | 34.572 |
| 9.234 | 34.618 |
| 9.2385 | 34.659 |
| 9.243 | 34.696 |
| 9.2475 | 34.733 |
| 9.252 | 34.772 |
| 9.2565 | 34.811 |
| 9.261 | 34.85 |
| 9.2655 | 34.884 |
| 9.27 | 34.913 |
| 9.2745 | 34.937 |
| 9.279 | 34.954 |
| 9.2835 | 34.969 |
| 9.288 | 34.981 |
| 9.2925 | 34.989 |
| 9.297 | 34.994 |
| 9.3015 | 34.994 |
| 9.306 | 34.989 |
| 9.3105 | 34.98 |
| 9.315 | 34.969 |
| 9.3195 | 34.956 |
| 9.324 | 34.941 |
| 9.3285 | 34.923 |
| 9.333 | 34.903 |
| 9.3375 | 34.878 |
| 9.342 | 34.853 |
| 9.3465 | 34.829 |
| 9.351 | 34.806 |
| 9.3555 | 34.787 |
| 9.36 | 34.767 |
| 9.3645 | 34.745 |
| 9.369 | 34.719 |
| 9.3735 | 34.686 |
| 9.378 | 34.65 |
| 9.3825 | 34.612 |
| 9.387 | 34.576 |
| 9.3915 | 34.541 |
| 9.396 | 34.507 |
| 9.4005 | 34.474 |
| 9.405 | 34.436 |
| 9.4095 | 34.394 |
| 9.414 | 34.349 |
| 9.4185 | 34.301 |
| 9.423 | 34.255 |
| 9.4275 | 34.209 |
| 9.432 | 34.163 |
| 9.4365 | 34.117 |
| 9.441 | 34.066 |
| 9.4455 | 34.013 |
| 9.45 | 33.957 |
| 9.4545 | 33.9 |
| 9.459 | 33.844 |
| 9.4635 | 33.788 |
| 9.468 | 33.733 |
| 9.4725 | 33.677 |
| 9.477 | 33.619 |
| 9.4815 | 33.561 |
| 9.486 | 33.503 |
| 9.4905 | 33.446 |
| 9.495 | 33.392 |
| 9.4995 | 33.339 |
| 9.504 | 33.283 |
| 9.5085 | 33.226 |
| 9.513 | 33.163 |
| 9.5175 | 33.095 |
| 9.522 | 33.026 |
| 9.5265 | 32.955 |
| 9.531 | 32.888 |
| 9.5355 | 32.824 |
| 9.54 | 32.76 |
| 9.5445 | 32.696 |
| 9.549 | 32.627 |
| 9.5535 | 32.554 |
| 9.558 | 32.478 |
| 9.5625 | 32.399 |
| 9.567 | 32.32 |
| 9.5715 | 32.241 |
| 9.576 | 32.162 |
| 9.5805 | 32.083 |
| 9.585 | 32.003 |
| 9.5895 | 31.92 |
| 9.594 | 31.839 |
| 9.5985 | 31.759 |
| 9.603 | 31.682 |
| 9.6075 | 31.609 |
| 9.612 | 31.537 |
| 9.6165 | 31.467 |
| 9.621 | 31.394 |
| 9.6255 | 31.316 |
| 9.63 | 31.236 |
| 9.6345 | 31.153 |
| 9.639 | 31.069 |
| 9.6435 | 30.985 |
| 9.648 | 30.902 |
| 9.6525 | 30.818 |
| 9.657 | 30.732 |
| 9.6615 | 30.643 |
| 9.666 | 30.552 |
| 9.6705 | 30.459 |
| 9.675 | 30.367 |
| 9.6795 | 30.277 |
| 9.684 | 30.187 |
| 9.6885 | 30.097 |
| 9.693 | 30.006 |
| 9.6975 | 29.912 |
| 9.702 | 29.815 |
| 9.7065 | 29.717 |
| 9.711 | 29.617 |
| 9.7155 | 29.519 |
| 9.72 | 29.423 |
| 9.7245 | 29.326 |
| 9.729 | 29.229 |
| 9.7335 | 29.129 |
| 9.738 | 29.025 |
| 9.7425 | 28.919 |
| 9.747 | 28.81 |
| 9.7515 | 28.703 |
| 9.756 | 28.597 |
| 9.7605 | 28.493 |
| 9.765 | 28.392 |
| 9.7695 | 28.291 |
| 9.774 | 28.188 |
| 9.7785 | 28.083 |
| 9.783 | 27.976 |
| 9.7875 | 27.866 |
| 9.792 | 27.756 |
| 9.7965 | 27.645 |
| 9.801 | 27.533 |
| 9.8055 | 27.419 |
| 9.81 | 27.304 |
| 9.8145 | 27.187 |
| 9.819 | 27.07 |
| 9.8235 | 26.952 |
| 9.828 | 26.835 |
| 9.8325 | 26.719 |
| 9.837 | 26.604 |
| 9.8415 | 26.488 |
| 9.846 | 26.371 |
| 9.8505 | 26.251 |
| 9.855 | 26.128 |
| 9.8595 | 26.004 |
| 9.864 | 25.879 |
| 9.8685 | 25.755 |
| 9.873 | 25.633 |
| 9.8775 | 25.511 |
| 9.882 | 25.39 |
| 9.8865 | 25.268 |
| 9.891 | 25.145 |
| 9.8955 | 25.021 |
| 9.9 | 24.895 |
| 9.9045 | 24.77 |
| 9.909 | 24.646 |
| 9.9135 | 24.524 |
| 9.918 | 24.403 |
| 9.9225 | 24.284 |
| 9.927 | 24.166 |
| 9.9315 | 24.048 |
| 9.936 | 23.931 |
| 9.9405 | 23.814 |
| 9.945 | 23.697 |
| 9.9495 | 23.581 |
| 9.954 | 23.464 |
| 9.9585 | 23.346 |
| 9.963 | 23.226 |
| 9.9675 | 23.103 |
| 9.972 | 22.978 |
| 9.9765 | 22.853 |
| 9.981 | 22.726 |
| 9.9855 | 22.6 |
| 9.99 | 22.477 |
| 9.9945 | 22.356 |
| 9.999 | 22.239 |
| 10.0035 | 22.125 |
| 10.008 | 22.012 |
| 10.0125 | 21.902 |
| 10.017 | 21.795 |
| 10.0215 | 21.689 |
| 10.026 | 21.585 |
| 10.0305 | 21.483 |
| 10.035 | 21.383 |
| 10.0395 | 21.282 |
| 10.044 | 21.181 |
| 10.0485 | 21.079 |
| 10.053 | 20.974 |
| 10.0575 | 20.869 |
| 10.062 | 20.762 |
| 10.0665 | 20.655 |
| 10.071 | 20.549 |
| 10.0755 | 20.445 |
| 10.08 | 20.342 |
| 10.0845 | 20.241 |
| 10.089 | 20.142 |
| 10.0935 | 20.045 |
| 10.098 | 19.95 |
| 10.1025 | 19.858 |
| 10.107 | 19.768 |
| 10.1115 | 19.68 |
| 10.116 | 19.595 |
| 10.1205 | 19.51 |
| 10.125 | 19.427 |
| 10.1295 | 19.345 |
| 10.134 | 19.262 |
| 10.1385 | 19.18 |
| 10.143 | 19.099 |
| 10.1475 | 19.019 |
| 10.152 | 18.941 |
| 10.1565 | 18.865 |
| 10.161 | 18.791 |
| 10.1655 | 18.718 |
| 10.17 | 18.647 |
| 10.1745 | 18.578 |
| 10.179 | 18.51 |
| 10.1835 | 18.444 |
| 10.188 | 18.38 |
| 10.1925 | 18.318 |
| 10.197 | 18.258 |
| 10.2015 | 18.2 |
| 10.206 | 18.145 |
| 10.2105 | 18.09 |
| 10.215 | 18.037 |
| 10.2195 | 17.984 |
| 10.224 | 17.933 |
| 10.2285 | 17.882 |
| 10.233 | 17.832 |
| 10.2375 | 17.783 |
| 10.242 | 17.735 |
| 10.2465 | 17.687 |
| 10.251 | 17.639 |
| 10.2555 | 17.591 |
| 10.26 | 17.542 |
| 10.2645 | 17.494 |
| 10.269 | 17.445 |
| 10.2735 | 17.398 |
| 10.278 | 17.351 |
| 10.2825 | 17.305 |
| 10.287 | 17.262 |
| 10.2915 | 17.22 |
| 10.296 | 17.18 |
| 10.3005 | 17.142 |
| 10.305 | 17.106 |
| 10.3095 | 17.072 |
| 10.314 | 17.04 |
| 10.3185 | 17.01 |
| 10.323 | 16.982 |
| 10.3275 | 16.956 |
| 10.332 | 16.931 |
| 10.3365 | 16.906 |
| 10.341 | 16.881 |
| 10.3455 | 16.856 |
| 10.35 | 16.83 |
| 10.3545 | 16.804 |
| 10.359 | 16.778 |
| 10.3635 | 16.753 |
| 10.368 | 16.728 |
| 10.3725 | 16.704 |
| 10.377 | 16.681 |
| 10.3815 | 16.659 |
| 10.386 | 16.639 |
| 10.3905 | 16.62 |
| 10.395 | 16.603 |
| 10.3995 | 16.588 |
| 10.404 | 16.575 |
| 10.4085 | 16.563 |
| 10.413 | 16.553 |
| 10.4175 | 16.544 |
| 10.422 | 16.535 |
| 10.4265 | 16.527 |
| 10.431 | 16.518 |
| 10.4355 | 16.509 |
| 10.44 | 16.499 |
| 10.4445 | 16.489 |
| 10.449 | 16.479 |
| 10.4535 | 16.469 |
| 10.458 | 16.46 |
| 10.4625 | 16.45 |
| 10.467 | 16.441 |
| 10.4715 | 16.432 |
| 10.476 | 16.423 |
| 10.4805 | 16.414 |
| 10.485 | 16.405 |
| 10.4895 | 16.397 |
| 10.494 | 16.39 |
| 10.4985 | 16.384 |
| 10.503 | 16.379 |
| 10.5075 | 16.375 |
| 10.512 | 16.371 |
| 10.5165 | 16.368 |
| 10.521 | 16.365 |
| 10.5255 | 16.362 |
| 10.53 | 16.359 |
| 10.5345 | 16.356 |
| 10.539 | 16.354 |
| 10.5435 | 16.352 |
| 10.548 | 16.35 |
| 10.5525 | 16.349 |
| 10.557 | 16.347 |
| 10.5615 | 16.346 |
| 10.566 | 16.345 |
| 10.5705 | 16.344 |
| 10.575 | 16.343 |
| 10.5795 | 16.343 |
| 10.584 | 16.344 |
| 10.5885 | 16.344 |
| 10.593 | 16.346 |
| 10.5975 | 16.347 |
| 10.602 | 16.348 |
| 10.6065 | 16.349 |
| 10.611 | 16.351 |
| 10.6155 | 16.353 |
| 10.62 | 16.355 |
| 10.6245 | 16.358 |
| 10.629 | 16.362 |
| 10.6335 | 16.366 |
| 10.638 | 16.371 |
| 10.6425 | 16.375 |
| 10.647 | 16.379 |
| 10.6515 | 16.383 |
| 10.656 | 16.386 |
| 10.6605 | 16.388 |
| 10.665 | 16.391 |
| 10.6695 | 16.394 |
| 10.674 | 16.397 |
| 10.6785 | 16.402 |
| 10.683 | 16.407 |
| 10.6875 | 16.412 |
| 10.692 | 16.417 |
| 10.6965 | 16.423 |
| 10.701 | 16.428 |
| 10.7055 | 16.433 |
| 10.71 | 16.438 |
| 10.7145 | 16.443 |
| 10.719 | 16.45 |
| 10.7235 | 16.457 |
| 10.728 | 16.466 |
| 10.7325 | 16.477 |
| 10.737 | 16.487 |
| 10.7415 | 16.499 |
| 10.746 | 16.509 |
| 10.7505 | 16.517 |
| 10.755 | 16.524 |
| 10.7595 | 16.528 |
| 10.764 | 16.53 |
| 10.7685 | 16.53 |
| 10.773 | 16.529 |
| 10.7775 | 16.528 |
| 10.782 | 16.527 |
| 10.7865 | 16.527 |
| 10.791 | 16.529 |
| 10.7955 | 16.533 |
| 10.8 | 16.538 |
| 10.8045 | 16.545 |
| 10.809 | 16.553 |
| 10.8135 | 16.563 |
| 10.818 | 16.572 |
| 10.8225 | 16.581 |
| 10.827 | 16.59 |
| 10.8315 | 16.599 |
| 10.836 | 16.607 |
| 10.8405 | 16.615 |
| 10.845 | 16.622 |
| 10.8495 | 16.63 |
| 10.854 | 16.638 |
| 10.8585 | 16.646 |
| 10.863 | 16.655 |
| 10.8675 | 16.664 |
| 10.872 | 16.674 |
| 10.8765 | 16.685 |
| 10.881 | 16.695 |
| 10.8855 | 16.706 |
| 10.89 | 16.716 |
| 10.8945 | 16.726 |
| 10.899 | 16.735 |
| 10.9035 | 16.744 |
| 10.908 | 16.753 |
| 10.9125 | 16.761 |
| 10.917 | 16.768 |
| 10.9215 | 16.775 |
| 10.926 | 16.782 |
| 10.9305 | 16.789 |
| 10.935 | 16.796 |
| 10.9395 | 16.804 |
| 10.944 | 16.812 |
| 10.9485 | 16.82 |
| 10.953 | 16.829 |
| 10.9575 | 16.837 |
| 10.962 | 16.846 |
| 10.9665 | 16.854 |
| 10.971 | 16.863 |
| 10.9755 | 16.87 |
| 10.98 | 16.878 |
| 10.9845 | 16.887 |
| 10.989 | 16.895 |
| 10.9935 | 16.905 |
| 10.998 | 16.916 |
| 11.0025 | 16.928 |
| 11.007 | 16.94 |
| 11.0115 | 16.952 |
| 11.016 | 16.965 |
| 11.0205 | 16.977 |
| 11.025 | 16.989 |
| 11.0295 | 16.999 |
| 11.034 | 17.009 |
| 11.0385 | 17.018 |
| 11.043 | 17.027 |
| 11.0475 | 17.035 |
| 11.052 | 17.044 |
| 11.0565 | 17.053 |
| 11.061 | 17.063 |
| 11.0655 | 17.073 |
| 11.07 | 17.083 |
| 11.0745 | 17.094 |
| 11.079 | 17.106 |
| 11.0835 | 17.117 |
| 11.088 | 17.129 |
| 11.0925 | 17.142 |
| 11.097 | 17.154 |
| 11.1015 | 17.167 |
| 11.106 | 17.179 |
| 11.1105 | 17.192 |
| 11.115 | 17.204 |
| 11.1195 | 17.215 |
| 11.124 | 17.226 |
| 11.1285 | 17.235 |
| 11.133 | 17.244 |
| 11.1375 | 17.252 |
| 11.142 | 17.26 |
| 11.1465 | 17.268 |
| 11.151 | 17.276 |
| 11.1555 | 17.284 |
| 11.16 | 17.293 |
| 11.1645 | 17.303 |
| 11.169 | 17.312 |
| 11.1735 | 17.323 |
| 11.178 | 17.333 |
| 11.1825 | 17.343 |
| 11.187 | 17.354 |
| 11.1915 | 17.364 |
| 11.196 | 17.375 |
| 11.2005 | 17.385 |
| 11.205 | 17.396 |
| 11.2095 | 17.408 |
| 11.214 | 17.42 |
| 11.2185 | 17.433 |
| 11.223 | 17.446 |
| 11.2275 | 17.459 |
| 11.232 | 17.473 |
| 11.2365 | 17.487 |
| 11.241 | 17.501 |
| 11.2455 | 17.515 |
| 11.25 | 17.528 |
| 11.2545 | 17.542 |
| 11.259 | 17.555 |
| 11.2635 | 17.567 |
| 11.268 | 17.58 |
| 11.2725 | 17.594 |
| 11.277 | 17.607 |
| 11.2815 | 17.622 |
| 11.286 | 17.637 |
| 11.2905 | 17.653 |
| 11.295 | 17.669 |
| 11.2995 | 17.686 |
| 11.304 | 17.703 |
| 11.3085 | 17.719 |
| 11.313 | 17.734 |
| 11.3175 | 17.747 |
| 11.322 | 17.759 |
| 11.3265 | 17.77 |
| 11.331 | 17.78 |
| 11.3355 | 17.789 |
| 11.34 | 17.798 |
| 11.3445 | 17.808 |
| 11.349 | 17.819 |
| 11.3535 | 17.831 |
| 11.358 | 17.845 |
| 11.3625 | 17.86 |
| 11.367 | 17.876 |
| 11.3715 | 17.893 |
| 11.376 | 17.91 |
| 11.3805 | 17.927 |
| 11.385 | 17.944 |
| 11.3895 | 17.961 |
| 11.394 | 17.977 |
| 11.3985 | 17.994 |
| 11.403 | 18.01 |
| 11.4075 | 18.025 |
| 11.412 | 18.039 |
| 11.4165 | 18.053 |
| 11.421 | 18.065 |
| 11.4255 | 18.077 |
| 11.43 | 18.088 |
| 11.4345 | 18.098 |
| 11.439 | 18.109 |
| 11.4435 | 18.12 |
| 11.448 | 18.132 |
| 11.4525 | 18.146 |
| 11.457 | 18.161 |
| 11.4615 | 18.178 |
| 11.466 | 18.196 |
| 11.4705 | 18.215 |
| 11.475 | 18.233 |
| 11.4795 | 18.251 |
| 11.484 | 18.269 |
| 11.4885 | 18.285 |
| 11.493 | 18.3 |
| 11.4975 | 18.315 |
| 11.502 | 18.328 |
| 11.5065 | 18.342 |
| 11.511 | 18.355 |
| 11.5155 | 18.369 |
| 11.52 | 18.384 |
| 11.5245 | 18.399 |
| 11.529 | 18.415 |
| 11.5335 | 18.432 |
| 11.538 | 18.45 |
| 11.5425 | 18.468 |
| 11.547 | 18.486 |
| 11.5515 | 18.505 |
| 11.556 | 18.524 |
| 11.5605 | 18.543 |
| 11.565 | 18.562 |
| 11.5695 | 18.581 |
| 11.574 | 18.6 |
| 11.5785 | 18.618 |
| 11.583 | 18.636 |
| 11.5875 | 18.653 |
| 11.592 | 18.669 |
| 11.5965 | 18.683 |
| 11.601 | 18.697 |
| 11.6055 | 18.709 |
| 11.61 | 18.722 |
| 11.6145 | 18.733 |
| 11.619 | 18.744 |
| 11.6235 | 18.756 |
| 11.628 | 18.768 |
| 11.6325 | 18.781 |
| 11.637 | 18.795 |
| 11.6415 | 18.81 |
| 11.646 | 18.826 |
| 11.6505 | 18.843 |
| 11.655 | 18.86 |
| 11.6595 | 18.878 |
| 11.664 | 18.896 |
| 11.6685 | 18.915 |
| 11.673 | 18.933 |
| 11.6775 | 18.95 |
| 11.682 | 18.966 |
| 11.6865 | 18.982 |
| 11.691 | 18.997 |
| 11.6955 | 19.01 |
| 11.7 | 19.023 |
| 11.7045 | 19.036 |
| 11.709 | 19.049 |
| 11.7135 | 19.061 |
| 11.718 | 19.074 |
| 11.7225 | 19.088 |
| 11.727 | 19.102 |
| 11.7315 | 19.118 |
| 11.736 | 19.134 |
| 11.7405 | 19.15 |
| 11.745 | 19.167 |
| 11.7495 | 19.183 |
| 11.754 | 19.2 |
| 11.7585 | 19.215 |
| 11.763 | 19.23 |
| 11.7675 | 19.245 |
| 11.772 | 19.258 |
| 11.7765 | 19.271 |
| 11.781 | 19.282 |
| 11.7855 | 19.294 |
| 11.79 | 19.304 |
| 11.7945 | 19.314 |
| 11.799 | 19.324 |
| 11.8035 | 19.334 |
| 11.808 | 19.343 |
| 11.8125 | 19.353 |
| 11.817 | 19.363 |
| 11.8215 | 19.374 |
| 11.826 | 19.387 |
| 11.8305 | 19.4 |
| 11.835 | 19.415 |
| 11.8395 | 19.431 |
| 11.844 | 19.449 |
| 11.8485 | 19.467 |
| 11.853 | 19.486 |
| 11.8575 | 19.504 |
| 11.862 | 19.522 |
| 11.8665 | 19.539 |
| 11.871 | 19.554 |
| 11.8755 | 19.566 |
| 11.88 | 19.577 |
| 11.8845 | 19.585 |
| 11.889 | 19.591 |
| 11.8935 | 19.595 |
| 11.898 | 19.599 |
| 11.9025 | 19.603 |
| 11.907 | 19.606 |
| 11.9115 | 19.612 |
| 11.916 | 19.619 |
| 11.9205 | 19.628 |
| 11.925 | 19.64 |
| 11.9295 | 19.654 |
| 11.934 | 19.671 |
| 11.9385 | 19.689 |
| 11.943 | 19.708 |
| 11.9475 | 19.728 |
| 11.952 | 19.747 |
| 11.9565 | 19.763 |
| 11.961 | 19.778 |
| 11.9655 | 19.791 |
| 11.97 | 19.801 |
| 11.9745 | 19.809 |
| 11.979 | 19.814 |
| 11.9835 | 19.818 |
| 11.988 | 19.82 |
| 11.9925 | 19.82 |
| 11.997 | 19.821 |
| 12.0015 | 19.821 |
| 12.006 | 19.822 |
| 12.0105 | 19.823 |
| 12.015 | 19.824 |
| 12.0195 | 19.826 |
| 12.024 | 19.829 |
| 12.0285 | 19.833 |
| 12.033 | 19.837 |
| 12.0375 | 19.842 |
| 12.042 | 19.848 |
| 12.0465 | 19.854 |
| 12.051 | 19.862 |
| 12.0555 | 19.87 |
| 12.06 | 19.879 |
| 12.0645 | 19.889 |
| 12.069 | 19.898 |
| 12.0735 | 19.907 |
| 12.078 | 19.916 |
| 12.0825 | 19.925 |
| 12.087 | 19.932 |
| 12.0915 | 19.938 |
| 12.096 | 19.944 |
| 12.1005 | 19.949 |
| 12.105 | 19.953 |
| 12.1095 | 19.957 |
| 12.114 | 19.96 |
| 12.1185 | 19.964 |
| 12.123 | 19.968 |
| 12.1275 | 19.972 |
| 12.132 | 19.976 |
| 12.1365 | 19.981 |
| 12.141 | 19.986 |
| 12.1455 | 19.991 |
| 12.15 | 19.996 |
| 12.1545 | 20.001 |
| 12.159 | 20.006 |
| 12.1635 | 20.012 |
| 12.168 | 20.017 |
| 12.1725 | 20.022 |
| 12.177 | 20.026 |
| 12.1815 | 20.03 |
| 12.186 | 20.034 |
| 12.1905 | 20.037 |
| 12.195 | 20.039 |
| 12.1995 | 20.042 |
| 12.204 | 20.044 |
| 12.2085 | 20.045 |
| 12.213 | 20.047 |
| 12.2175 | 20.049 |
| 12.222 | 20.052 |
| 12.2265 | 20.055 |
| 12.231 | 20.058 |
| 12.2355 | 20.061 |
| 12.24 | 20.065 |
| 12.2445 | 20.068 |
| 12.249 | 20.071 |
| 12.2535 | 20.073 |
| 12.258 | 20.075 |
| 12.2625 | 20.075 |
| 12.267 | 20.075 |
| 12.2715 | 20.074 |
| 12.276 | 20.072 |
| 12.2805 | 20.07 |
| 12.285 | 20.068 |
| 12.2895 | 20.065 |
| 12.294 | 20.063 |
| 12.2985 | 20.06 |
| 12.303 | 20.058 |
| 12.3075 | 20.055 |
| 12.312 | 20.053 |
| 12.3165 | 20.05 |
| 12.321 | 20.046 |
| 12.3255 | 20.043 |
| 12.33 | 20.039 |
| 12.3345 | 20.035 |
| 12.339 | 20.032 |
| 12.3435 | 20.028 |
| 12.348 | 20.025 |
| 12.3525 | 20.023 |
| 12.357 | 20.021 |
| 12.3615 | 20.02 |
| 12.366 | 20.019 |
| 12.3705 | 20.018 |
| 12.375 | 20.018 |
| 12.3795 | 20.017 |
| 12.384 | 20.016 |
| 12.3885 | 20.014 |
| 12.393 | 20.012 |
| 12.3975 | 20.01 |
| 12.402 | 20.008 |
| 12.4065 | 20.005 |
| 12.411 | 20.002 |
| 12.4155 | 19.998 |
| 12.42 | 19.995 |
| 12.4245 | 19.991 |
| 12.429 | 19.986 |
| 12.4335 | 19.981 |
| 12.438 | 19.974 |
| 12.4425 | 19.967 |
| 12.447 | 19.959 |
| 12.4515 | 19.95 |
| 12.456 | 19.94 |
| 12.4605 | 19.93 |
| 12.465 | 19.92 |
| 12.4695 | 19.909 |
| 12.474 | 19.899 |
| 12.4785 | 19.891 |
| 12.483 | 19.883 |
| 12.4875 | 19.876 |
| 12.492 | 19.869 |
| 12.4965 | 19.864 |
| 12.501 | 19.86 |
| 12.5055 | 19.856 |
| 12.51 | 19.853 |
| 12.5145 | 19.85 |
| 12.519 | 19.847 |
| 12.5235 | 19.843 |
| 12.528 | 19.84 |
| 12.5325 | 19.837 |
| 12.537 | 19.833 |
| 12.5415 | 19.829 |
| 12.546 | 19.824 |
| 12.5505 | 19.819 |
| 12.555 | 19.813 |
| 12.5595 | 19.807 |
| 12.564 | 19.8 |
| 12.5685 | 19.793 |
| 12.573 | 19.785 |
| 12.5775 | 19.778 |
| 12.582 | 19.771 |
| 12.5865 | 19.764 |
| 12.591 | 19.759 |
| 12.5955 | 19.754 |
| 12.6 | 19.75 |
| 12.6045 | 19.747 |
| 12.609 | 19.746 |
| 12.6135 | 19.744 |
| 12.618 | 19.742 |
| 12.6225 | 19.74 |
| 12.627 | 19.738 |
| 12.6315 | 19.734 |
| 12.636 | 19.729 |
| 12.6405 | 19.722 |
| 12.645 | 19.714 |
| 12.6495 | 19.706 |
| 12.654 | 19.696 |
| 12.6585 | 19.685 |
| 12.663 | 19.674 |
| 12.6675 | 19.664 |
| 12.672 | 19.654 |
| 12.6765 | 19.645 |
| 12.681 | 19.637 |
| 12.6855 | 19.63 |
| 12.69 | 19.624 |
| 12.6945 | 19.618 |
| 12.699 | 19.613 |
| 12.7035 | 19.608 |
| 12.708 | 19.604 |
| 12.7125 | 19.599 |
| 12.717 | 19.595 |
| 12.7215 | 19.59 |
| 12.726 | 19.584 |
| 12.7305 | 19.579 |
| 12.735 | 19.573 |
| 12.7395 | 19.567 |
| 12.744 | 19.561 |
| 12.7485 | 19.554 |
| 12.753 | 19.548 |
| 12.7575 | 19.541 |
| 12.762 | 19.534 |
| 12.7665 | 19.527 |
| 12.771 | 19.52 |
| 12.7755 | 19.514 |
| 12.78 | 19.507 |
| 12.7845 | 19.501 |
| 12.789 | 19.494 |
| 12.7935 | 19.488 |
| 12.798 | 19.482 |
| 12.8025 | 19.477 |
| 12.807 | 19.471 |
| 12.8115 | 19.465 |
| 12.816 | 19.459 |
| 12.8205 | 19.452 |
| 12.825 | 19.445 |
| 12.8295 | 19.438 |
| 12.834 | 19.43 |
| 12.8385 | 19.422 |
| 12.843 | 19.415 |
| 12.8475 | 19.407 |
| 12.852 | 19.4 |
| 12.8565 | 19.392 |
| 12.861 | 19.386 |
| 12.8655 | 19.38 |
| 12.87 | 19.374 |
| 12.8745 | 19.369 |
| 12.879 | 19.364 |
| 12.8835 | 19.359 |
| 12.888 | 19.355 |
| 12.8925 | 19.35 |
| 12.897 | 19.345 |
| 12.9015 | 19.339 |
| 12.906 | 19.333 |
| 12.9105 | 19.327 |
| 12.915 | 19.321 |
| 12.9195 | 19.314 |
| 12.924 | 19.307 |
| 12.9285 | 19.301 |
| 12.933 | 19.294 |
| 12.9375 | 19.288 |
| 12.942 | 19.283 |
| 12.9465 | 19.278 |
| 12.951 | 19.273 |
| 12.9555 | 19.27 |
| 12.96 | 19.267 |
| 12.9645 | 19.265 |
| 12.969 | 19.263 |
| 12.9735 | 19.263 |
| 12.978 | 19.263 |
| 12.9825 | 19.265 |
| 12.987 | 19.267 |
| 12.9915 | 19.269 |
| 12.996 | 19.273 |
| 13.0005 | 19.276 |
| 13.005 | 19.281 |
| 13.0095 | 19.285 |
| 13.014 | 19.288 |
| 13.0185 | 19.291 |
| 13.023 | 19.294 |
| 13.0275 | 19.295 |
| 13.032 | 19.296 |
| 13.0365 | 19.296 |
| 13.041 | 19.295 |
| 13.0455 | 19.294 |
| 13.05 | 19.291 |
| 13.0545 | 19.289 |
| 13.059 | 19.286 |
| 13.0635 | 19.283 |
| 13.068 | 19.28 |
| 13.0725 | 19.277 |
| 13.077 | 19.274 |
| 13.0815 | 19.272 |
| 13.086 | 19.27 |
| 13.0905 | 19.268 |
| 13.095 | 19.267 |
| 13.0995 | 19.266 |
| 13.104 | 19.266 |
| 13.1085 | 19.266 |
| 13.113 | 19.267 |
| 13.1175 | 19.269 |
| 13.122 | 19.271 |
| 13.1265 | 19.275 |
| 13.131 | 19.279 |
| 13.1355 | 19.283 |
| 13.14 | 19.288 |
| 13.1445 | 19.294 |
| 13.149 | 19.299 |
| 13.1535 | 19.304 |
| 13.158 | 19.308 |
| 13.1625 | 19.313 |
| 13.167 | 19.316 |
| 13.1715 | 19.319 |
| 13.176 | 19.322 |
| 13.1805 | 19.324 |
| 13.185 | 19.327 |
| 13.1895 | 19.329 |
| 13.194 | 19.332 |
| 13.1985 | 19.334 |
| 13.203 | 19.337 |
| 13.2075 | 19.341 |
| 13.212 | 19.345 |
| 13.2165 | 19.349 |
| 13.221 | 19.353 |
| 13.2255 | 19.357 |
| 13.23 | 19.361 |
| 13.2345 | 19.364 |
| 13.239 | 19.367 |
| 13.2435 | 19.369 |
| 13.248 | 19.371 |
| 13.2525 | 19.373 |
| 13.257 | 19.374 |
| 13.2615 | 19.375 |
| 13.266 | 19.377 |
| 13.2705 | 19.379 |
| 13.275 | 19.381 |
| 13.2795 | 19.384 |
| 13.284 | 19.387 |
| 13.2885 | 19.391 |
| 13.293 | 19.396 |
| 13.2975 | 19.401 |
| 13.302 | 19.407 |
| 13.3065 | 19.413 |
| 13.311 | 19.419 |
| 13.3155 | 19.426 |
| 13.32 | 19.432 |
| 13.3245 | 19.439 |
| 13.329 | 19.446 |
| 13.3335 | 19.453 |
| 13.338 | 19.46 |
| 13.3425 | 19.466 |
| 13.347 | 19.473 |
| 13.3515 | 19.479 |
| 13.356 | 19.485 |
| 13.3605 | 19.49 |
| 13.365 | 19.494 |
| 13.3695 | 19.497 |
| 13.374 | 19.5 |
| 13.3785 | 19.502 |
| 13.383 | 19.502 |
| 13.3875 | 19.502 |
| 13.392 | 19.501 |
| 13.3965 | 19.501 |
| 13.401 | 19.5 |
| 13.4055 | 19.499 |
| 13.41 | 19.499 |
| 13.4145 | 19.499 |
| 13.419 | 19.5 |
| 13.4235 | 19.501 |
| 13.428 | 19.503 |
| 13.4325 | 19.505 |
| 13.437 | 19.508 |
| 13.4415 | 19.511 |
| 13.446 | 19.514 |
| 13.4505 | 19.517 |
| 13.455 | 19.52 |
| 13.4595 | 19.523 |
| 13.464 | 19.525 |
| 13.4685 | 19.528 |
| 13.473 | 19.53 |
| 13.4775 | 19.532 |
| 13.482 | 19.535 |
| 13.4865 | 19.537 |
| 13.491 | 19.539 |
| 13.4955 | 19.542 |
| 13.5 | 19.545 |
| 13.5045 | 19.547 |
| 13.509 | 19.549 |
| 13.5135 | 19.551 |
| 13.518 | 19.553 |
| 13.5225 | 19.555 |
| 13.527 | 19.557 |
| 13.5315 | 19.558 |
| 13.536 | 19.559 |
| 13.5405 | 19.561 |
| 13.545 | 19.564 |
| 13.5495 | 19.566 |
| 13.554 | 19.57 |
| 13.5585 | 19.574 |
| 13.563 | 19.58 |
| 13.5675 | 19.586 |
| 13.572 | 19.593 |
| 13.5765 | 19.6 |
| 13.581 | 19.608 |
| 13.5855 | 19.616 |
| 13.59 | 19.624 |
| 13.5945 | 19.631 |
| 13.599 | 19.637 |
| 13.6035 | 19.642 |
| 13.608 | 19.646 |
| 13.6125 | 19.649 |
| 13.617 | 19.651 |
| 13.6215 | 19.651 |
| 13.626 | 19.651 |
| 13.6305 | 19.65 |
| 13.635 | 19.648 |
| 13.6395 | 19.646 |
| 13.644 | 19.644 |
| 13.6485 | 19.642 |
| 13.653 | 19.64 |
| 13.6575 | 19.638 |
| 13.662 | 19.637 |
| 13.6665 | 19.636 |
| 13.671 | 19.635 |
| 13.6755 | 19.635 |
| 13.68 | 19.635 |
| 13.6845 | 19.636 |
| 13.689 | 19.637 |
| 13.6935 | 19.639 |
| 13.698 | 19.642 |
| 13.7025 | 19.645 |
| 13.707 | 19.648 |
| 13.7115 | 19.652 |
| 13.716 | 19.656 |
| 13.7205 | 19.661 |
| 13.725 | 19.665 |
| 13.7295 | 19.67 |
| 13.734 | 19.674 |
| 13.7385 | 19.678 |
| 13.743 | 19.682 |
| 13.7475 | 19.685 |
| 13.752 | 19.688 |
| 13.7565 | 19.691 |
| 13.761 | 19.694 |
| 13.7655 | 19.696 |
| 13.77 | 19.699 |
| 13.7745 | 19.702 |
| 13.779 | 19.705 |
| 13.7835 | 19.708 |
| 13.788 | 19.712 |
| 13.7925 | 19.717 |
| 13.797 | 19.722 |
| 13.8015 | 19.727 |
| 13.806 | 19.732 |
| 13.8105 | 19.738 |
| 13.815 | 19.744 |
| 13.8195 | 19.749 |
| 13.824 | 19.754 |
| 13.8285 | 19.758 |
| 13.833 | 19.763 |
| 13.8375 | 19.767 |
| 13.842 | 19.771 |
| 13.8465 | 19.774 |
| 13.851 | 19.778 |
| 13.8555 | 19.781 |
| 13.86 | 19.784 |
| 13.8645 | 19.788 |
| 13.869 | 19.792 |
| 13.8735 | 19.796 |
| 13.878 | 19.8 |
| 13.8825 | 19.804 |
| 13.887 | 19.808 |
| 13.8915 | 19.812 |
| 13.896 | 19.816 |
| 13.9005 | 19.82 |
| 13.905 | 19.823 |
| 13.9095 | 19.826 |
| 13.914 | 19.828 |
| 13.9185 | 19.831 |
| 13.923 | 19.834 |
| 13.9275 | 19.836 |
| 13.932 | 19.839 |
| 13.9365 | 19.841 |
| 13.941 | 19.844 |
| 13.9455 | 19.848 |
| 13.95 | 19.851 |
| 13.9545 | 19.855 |
| 13.959 | 19.859 |
| 13.9635 | 19.863 |
| 13.968 | 19.868 |
| 13.9725 | 19.872 |
| 13.977 | 19.877 |
| 13.9815 | 19.881 |
| 13.986 | 19.886 |
| 13.9905 | 19.89 |
| 13.995 | 19.895 |
| 13.9995 | 19.9 |
| 14.004 | 19.905 |
| 14.0085 | 19.911 |
| 14.013 | 19.917 |
| 14.0175 | 19.923 |
| 14.022 | 19.93 |
| 14.0265 | 19.937 |
| 14.031 | 19.945 |
| 14.0355 | 19.952 |
| 14.04 | 19.96 |
| 14.0445 | 19.967 |
| 14.049 | 19.975 |
| 14.0535 | 19.982 |
| 14.058 | 19.988 |
| 14.0625 | 19.994 |
| 14.067 | 20 |
| 14.0715 | 20.006 |
| 14.076 | 20.011 |
| 14.0805 | 20.016 |
| 14.085 | 20.021 |
| 14.0895 | 20.025 |
| 14.094 | 20.03 |
| 14.0985 | 20.034 |
| 14.103 | 20.039 |
| 14.1075 | 20.043 |
| 14.112 | 20.046 |
| 14.1165 | 20.05 |
| 14.121 | 20.052 |
| 14.1255 | 20.055 |
| 14.13 | 20.057 |
| 14.1345 | 20.058 |
| 14.139 | 20.059 |
| 14.1435 | 20.059 |
| 14.148 | 20.059 |
| 14.1525 | 20.059 |
| 14.157 | 20.059 |
| 14.1615 | 20.059 |
| 14.166 | 20.06 |
| 14.1705 | 20.061 |
| 14.175 | 20.063 |
| 14.1795 | 20.066 |
| 14.184 | 20.07 |
| 14.1885 | 20.074 |
| 14.193 | 20.078 |
| 14.1975 | 20.084 |
| 14.202 | 20.089 |
| 14.2065 | 20.095 |
| 14.211 | 20.101 |
| 14.2155 | 20.106 |
| 14.22 | 20.111 |
| 14.2245 | 20.115 |
| 14.229 | 20.119 |
| 14.2335 | 20.122 |
| 14.238 | 20.125 |
| 14.2425 | 20.127 |
| 14.247 | 20.128 |
| 14.2515 | 20.13 |
| 14.256 | 20.131 |
| 14.2605 | 20.132 |
| 14.265 | 20.133 |
| 14.2695 | 20.134 |
| 14.274 | 20.135 |
| 14.2785 | 20.135 |
| 14.283 | 20.136 |
| 14.2875 | 20.136 |
| 14.292 | 20.136 |
| 14.2965 | 20.136 |
| 14.301 | 20.136 |
| 14.3055 | 20.135 |
| 14.31 | 20.135 |
| 14.3145 | 20.135 |
| 14.319 | 20.135 |
| 14.3235 | 20.136 |
| 14.328 | 20.137 |
| 14.3325 | 20.139 |
| 14.337 | 20.143 |
| 14.3415 | 20.149 |
| 14.346 | 20.155 |
| 14.3505 | 20.162 |
| 14.355 | 20.17 |
| 14.3595 | 20.179 |
| 14.364 | 20.189 |
| 14.3685 | 20.2 |
| 14.373 | 20.21 |
| 14.3775 | 20.22 |
| 14.382 | 20.229 |
| 14.3865 | 20.237 |
| 14.391 | 20.245 |
| 14.3955 | 20.253 |
| 14.4 | 20.259 |
| 14.4045 | 20.264 |
| 14.409 | 20.268 |
| 14.4135 | 20.271 |
| 14.418 | 20.274 |
| 14.4225 | 20.277 |
| 14.427 | 20.28 |
| 14.4315 | 20.282 |
| 14.436 | 20.285 |
| 14.4405 | 20.287 |
| 14.445 | 20.29 |
| 14.4495 | 20.292 |
| 14.454 | 20.295 |
| 14.4585 | 20.297 |
| 14.463 | 20.299 |
| 14.4675 | 20.301 |
| 14.472 | 20.303 |
| 14.4765 | 20.304 |
| 14.481 | 20.305 |
| 14.4855 | 20.306 |
| 14.49 | 20.306 |
| 14.4945 | 20.306 |
| 14.499 | 20.307 |
| 14.5035 | 20.308 |
| 14.508 | 20.31 |
| 14.5125 | 20.311 |
| 14.517 | 20.314 |
| 14.5215 | 20.317 |
| 14.526 | 20.321 |
| 14.5305 | 20.325 |
| 14.535 | 20.33 |
| 14.5395 | 20.335 |
| 14.544 | 20.34 |
| 14.5485 | 20.345 |
| 14.553 | 20.35 |
| 14.5575 | 20.355 |
| 14.562 | 20.36 |
| 14.5665 | 20.364 |
| 14.571 | 20.367 |
| 14.5755 | 20.369 |
| 14.58 | 20.371 |
| 14.5845 | 20.373 |
| 14.589 | 20.375 |
| 14.5935 | 20.376 |
| 14.598 | 20.377 |
| 14.6025 | 20.379 |
| 14.607 | 20.38 |
| 14.6115 | 20.382 |
| 14.616 | 20.384 |
| 14.6205 | 20.386 |
| 14.625 | 20.388 |
| 14.6295 | 20.391 |
| 14.634 | 20.394 |
| 14.6385 | 20.397 |
| 14.643 | 20.401 |
| 14.6475 | 20.405 |
| 14.652 | 20.409 |
| 14.6565 | 20.414 |
| 14.661 | 20.418 |
| 14.6655 | 20.424 |
| 14.67 | 20.429 |
| 14.6745 | 20.435 |
| 14.679 | 20.441 |
| 14.6835 | 20.447 |
| 14.688 | 20.454 |
| 14.6925 | 20.461 |
| 14.697 | 20.467 |
| 14.7015 | 20.474 |
| 14.706 | 20.48 |
| 14.7105 | 20.487 |
| 14.715 | 20.493 |
| 14.7195 | 20.498 |
| 14.724 | 20.503 |
| 14.7285 | 20.507 |
| 14.733 | 20.511 |
| 14.7375 | 20.515 |
| 14.742 | 20.518 |
| 14.7465 | 20.52 |
| 14.751 | 20.523 |
| 14.7555 | 20.525 |
| 14.76 | 20.528 |
| 14.7645 | 20.53 |
| 14.769 | 20.532 |
| 14.7735 | 20.535 |
| 14.778 | 20.537 |
| 14.7825 | 20.539 |
| 14.787 | 20.541 |
| 14.7915 | 20.544 |
| 14.796 | 20.546 |
| 14.8005 | 20.548 |
| 14.805 | 20.549 |
| 14.8095 | 20.55 |
| 14.814 | 20.551 |
| 14.8185 | 20.552 |
| 14.823 | 20.552 |
| 14.8275 | 20.553 |
| 14.832 | 20.553 |
| 14.8365 | 20.553 |
| 14.841 | 20.554 |
| 14.8455 | 20.556 |
| 14.85 | 20.559 |
| 14.8545 | 20.563 |
| 14.859 | 20.567 |
| 14.8635 | 20.573 |
| 14.868 | 20.58 |
| 14.8725 | 20.589 |
| 14.877 | 20.599 |
| 14.8815 | 20.611 |
| 14.886 | 20.624 |
| 14.8905 | 20.638 |
| 14.895 | 20.654 |
| 14.8995 | 20.671 |
| 14.904 | 20.689 |
| 14.9085 | 20.708 |
| 14.913 | 20.726 |
| 14.9175 | 20.745 |
| 14.922 | 20.765 |
| 14.9265 | 20.785 |
| 14.931 | 20.805 |
| 14.9355 | 20.822 |
| 14.94 | 20.839 |
| 14.9445 | 20.855 |
| 14.949 | 20.87 |
| 14.9535 | 20.883 |
| 14.958 | 20.894 |
| 14.9625 | 20.904 |
| 14.967 | 20.911 |
| 14.9715 | 20.917 |
| 14.976 | 20.922 |
| 14.9805 | 20.925 |
| 14.985 | 20.927 |
| 14.9895 | 20.928 |
| 14.994 | 20.927 |
| 14.9985 | 20.925 |
| 15.003 | 20.922 |
| 15.0075 | 20.918 |
| 15.012 | 20.912 |
| 15.0165 | 20.905 |
| 15.021 | 20.898 |
| 15.0255 | 20.89 |
| 15.03 | 20.882 |
| 15.0345 | 20.873 |
| 15.039 | 20.864 |
| 15.0435 | 20.855 |
| 15.048 | 20.848 |
| 15.0525 | 20.841 |
| 15.057 | 20.835 |
| 15.0615 | 20.829 |
| 15.066 | 20.824 |
| 15.0705 | 20.821 |
| 15.075 | 20.819 |
| 15.0795 | 20.818 |
| 15.084 | 20.817 |
| 15.0885 | 20.818 |
| 15.093 | 20.82 |
| 15.0975 | 20.823 |
| 15.102 | 20.827 |
| 15.1065 | 20.832 |
| 15.111 | 20.838 |
| 15.1155 | 20.845 |
| 15.12 | 20.851 |
| 15.1245 | 20.859 |
| 15.129 | 20.868 |
| 15.1335 | 20.876 |
| 15.138 | 20.884 |
| 15.1425 | 20.892 |
| 15.147 | 20.9 |
| 15.1515 | 20.908 |
| 15.156 | 20.915 |
| 15.1605 | 20.921 |
| 15.165 | 20.927 |
| 15.1695 | 20.932 |
| 15.174 | 20.936 |
| 15.1785 | 20.94 |
| 15.183 | 20.943 |
| 15.1875 | 20.945 |
| 15.192 | 20.947 |
| 15.1965 | 20.948 |
| 15.201 | 20.949 |
| 15.2055 | 20.95 |
| 15.21 | 20.951 |
| 15.2145 | 20.951 |
| 15.219 | 20.952 |
| 15.2235 | 20.952 |
| 15.228 | 20.952 |
| 15.2325 | 20.951 |
| 15.237 | 20.951 |
| 15.2415 | 20.951 |
| 15.246 | 20.95 |
| 15.2505 | 20.949 |
| 15.255 | 20.948 |
| 15.2595 | 20.947 |
| 15.264 | 20.945 |
| 15.2685 | 20.943 |
| 15.273 | 20.941 |
| 15.2775 | 20.94 |
| 15.282 | 20.938 |
| 15.2865 | 20.937 |
| 15.291 | 20.936 |
| 15.2955 | 20.936 |
| 15.3 | 20.936 |
| 15.3045 | 20.938 |
| 15.309 | 20.941 |
| 15.3135 | 20.944 |
| 15.318 | 20.948 |
| 15.3225 | 20.953 |
| 15.327 | 20.959 |
| 15.3315 | 20.966 |
| 15.336 | 20.974 |
| 15.3405 | 20.982 |
| 15.345 | 20.989 |
| 15.3495 | 20.997 |
| 15.354 | 21.005 |
| 15.3585 | 21.013 |
| 15.363 | 21.02 |
| 15.3675 | 21.027 |
| 15.372 | 21.034 |
| 15.3765 | 21.039 |
| 15.381 | 21.044 |
| 15.3855 | 21.048 |
| 15.39 | 21.052 |
| 15.3945 | 21.055 |
| 15.399 | 21.057 |
| 15.4035 | 21.059 |
| 15.408 | 21.06 |
| 15.4125 | 21.061 |
| 15.417 | 21.062 |
| 15.4215 | 21.063 |
| 15.426 | 21.064 |
| 15.4305 | 21.064 |
| 15.435 | 21.065 |
| 15.4395 | 21.067 |
| 15.444 | 21.069 |
| 15.4485 | 21.072 |
| 15.453 | 21.075 |
| 15.4575 | 21.078 |
| 15.462 | 21.082 |
| 15.4665 | 21.087 |
| 15.471 | 21.093 |
| 15.4755 | 21.1 |
| 15.48 | 21.107 |
| 15.4845 | 21.114 |
| 15.489 | 21.122 |
| 15.4935 | 21.13 |
| 15.498 | 21.138 |
| 15.5025 | 21.147 |
| 15.507 | 21.156 |
| 15.5115 | 21.164 |
| 15.516 | 21.171 |
| 15.5205 | 21.178 |
| 15.525 | 21.184 |
| 15.5295 | 21.19 |
| 15.534 | 21.196 |
| 15.5385 | 21.2 |
| 15.543 | 21.204 |
| 15.5475 | 21.207 |
| 15.552 | 21.209 |
| 15.5565 | 21.21 |
| 15.561 | 21.212 |
| 15.5655 | 21.214 |
| 15.57 | 21.215 |
| 15.5745 | 21.216 |
| 15.579 | 21.218 |
| 15.5835 | 21.219 |
| 15.588 | 21.222 |
| 15.5925 | 21.225 |
| 15.597 | 21.228 |
| 15.6015 | 21.232 |
| 15.606 | 21.236 |
| 15.6105 | 21.24 |
| 15.615 | 21.245 |
| 15.6195 | 21.249 |
| 15.624 | 21.254 |
| 15.6285 | 21.259 |
| 15.633 | 21.264 |
| 15.6375 | 21.268 |
| 15.642 | 21.272 |
| 15.6465 | 21.275 |
| 15.651 | 21.279 |
| 15.6555 | 21.282 |
| 15.66 | 21.285 |
| 15.6645 | 21.288 |
| 15.669 | 21.29 |
| 15.6735 | 21.293 |
| 15.678 | 21.295 |
| 15.6825 | 21.298 |
| 15.687 | 21.302 |
| 15.6915 | 21.305 |
| 15.696 | 21.309 |
| 15.7005 | 21.314 |
| 15.705 | 21.318 |
| 15.7095 | 21.322 |
| 15.714 | 21.327 |
| 15.7185 | 21.332 |
| 15.723 | 21.336 |
| 15.7275 | 21.341 |
| 15.732 | 21.345 |
| 15.7365 | 21.348 |
| 15.741 | 21.351 |
| 15.7455 | 21.353 |
| 15.75 | 21.355 |
| 15.7545 | 21.357 |
| 15.759 | 21.358 |
| 15.7635 | 21.358 |
| 15.768 | 21.358 |
| 15.7725 | 21.358 |
| 15.777 | 21.357 |
| 15.7815 | 21.357 |
| 15.786 | 21.358 |
| 15.7905 | 21.358 |
| 15.795 | 21.359 |
| 15.7995 | 21.36 |
| 15.804 | 21.362 |
| 15.8085 | 21.364 |
| 15.813 | 21.368 |
| 15.8175 | 21.372 |
| 15.822 | 21.377 |
| 15.8265 | 21.383 |
| 15.831 | 21.39 |
| 15.8355 | 21.397 |
| 15.84 | 21.405 |
| 15.8445 | 21.413 |
| 15.849 | 21.422 |
| 15.8535 | 21.432 |
| 15.858 | 21.441 |
| 15.8625 | 21.451 |
| 15.867 | 21.462 |
| 15.8715 | 21.473 |
| 15.876 | 21.483 |
| 15.8805 | 21.494 |
| 15.885 | 21.505 |
| 15.8895 | 21.515 |
| 15.894 | 21.525 |
| 15.8985 | 21.536 |
| 15.903 | 21.546 |
| 15.9075 | 21.555 |
| 15.912 | 21.563 |
| 15.9165 | 21.571 |
| 15.921 | 21.578 |
| 15.9255 | 21.584 |
| 15.93 | 21.59 |
| 15.9345 | 21.595 |
| 15.939 | 21.599 |
| 15.9435 | 21.602 |
| 15.948 | 21.604 |
| 15.9525 | 21.605 |
| 15.957 | 21.606 |
| 15.9615 | 21.607 |
| 15.966 | 21.607 |
| 15.9705 | 21.606 |
| 15.975 | 21.605 |
| 15.9795 | 21.604 |
| 15.984 | 21.603 |
| 15.9885 | 21.602 |
| 15.993 | 21.601 |
| 15.9975 | 21.6 |
| 16.002 | 21.6 |
| 16.0065 | 21.599 |
| 16.011 | 21.598 |
| 16.0155 | 21.597 |
| 16.02 | 21.597 |
| 16.0245 | 21.596 |
| 16.029 | 21.596 |
| 16.0335 | 21.595 |
| 16.038 | 21.595 |
| 16.0425 | 21.594 |
| 16.047 | 21.593 |
| 16.0515 | 21.592 |
| 16.056 | 21.592 |
| 16.0605 | 21.591 |
| 16.065 | 21.591 |
| 16.0695 | 21.592 |
| 16.074 | 21.592 |
| 16.0785 | 21.593 |
| 16.083 | 21.594 |
| 16.0875 | 21.597 |
| 16.092 | 21.6 |
| 16.0965 | 21.603 |
| 16.101 | 21.608 |
| 16.1055 | 21.613 |
| 16.11 | 21.618 |
| 16.1145 | 21.623 |
| 16.119 | 21.629 |
| 16.1235 | 21.635 |
| 16.128 | 21.642 |
| 16.1325 | 21.649 |
| 16.137 | 21.655 |
| 16.1415 | 21.66 |
| 16.146 | 21.666 |
| 16.1505 | 21.671 |
| 16.155 | 21.675 |
| 16.1595 | 21.679 |
| 16.164 | 21.683 |
| 16.1685 | 21.686 |
| 16.173 | 21.688 |
| 16.1775 | 21.69 |
| 16.182 | 21.691 |
| 16.1865 | 21.692 |
| 16.191 | 21.693 |
| 16.1955 | 21.694 |
| 16.2 | 21.695 |
| 16.2045 | 21.696 |
| 16.209 | 21.697 |
| 16.2135 | 21.698 |
| 16.218 | 21.699 |
| 16.2225 | 21.7 |
| 16.227 | 21.702 |
| 16.2315 | 21.704 |
| 16.236 | 21.706 |
| 16.2405 | 21.708 |
| 16.245 | 21.711 |
| 16.2495 | 21.714 |
| 16.254 | 21.717 |
| 16.2585 | 21.72 |
| 16.263 | 21.723 |
| 16.2675 | 21.727 |
| 16.272 | 21.732 |
| 16.2765 | 21.737 |
| 16.281 | 21.742 |
| 16.2855 | 21.748 |
| 16.29 | 21.754 |
| 16.2945 | 21.76 |
| 16.299 | 21.767 |
| 16.3035 | 21.775 |
| 16.308 | 21.783 |
| 16.3125 | 21.792 |
| 16.317 | 21.801 |
| 16.3215 | 21.81 |
| 16.326 | 21.819 |
| 16.3305 | 21.828 |
| 16.335 | 21.838 |
| 16.3395 | 21.847 |
| 16.344 | 21.856 |
| 16.3485 | 21.864 |
| 16.353 | 21.872 |
| 16.3575 | 21.879 |
| 16.362 | 21.885 |
| 16.3665 | 21.89 |
| 16.371 | 21.895 |
| 16.3755 | 21.899 |
| 16.38 | 21.903 |
| 16.3845 | 21.905 |
| 16.389 | 21.906 |
| 16.3935 | 21.907 |
| 16.398 | 21.907 |
| 16.4025 | 21.907 |
| 16.407 | 21.907 |
| 16.4115 | 21.907 |
| 16.416 | 21.906 |
| 16.4205 | 21.904 |
| 16.425 | 21.903 |
| 16.4295 | 21.903 |
| 16.434 | 21.902 |
| 16.4385 | 21.902 |
| 16.443 | 21.902 |
| 16.4475 | 21.903 |
| 16.452 | 21.903 |
| 16.4565 | 21.905 |
| 16.461 | 21.907 |
| 16.4655 | 21.911 |
| 16.47 | 21.914 |
| 16.4745 | 21.919 |
| 16.479 | 21.924 |
| 16.4835 | 21.93 |
| 16.488 | 21.936 |
| 16.4925 | 21.944 |
| 16.497 | 21.953 |
| 16.5015 | 21.963 |
| 16.506 | 21.973 |
| 16.5105 | 21.984 |
| 16.515 | 21.995 |
| 16.5195 | 22.007 |
| 16.524 | 22.019 |
| 16.5285 | 22.032 |
| 16.533 | 22.045 |
| 16.5375 | 22.058 |
| 16.542 | 22.07 |
| 16.5465 | 22.081 |
| 16.551 | 22.093 |
| 16.5555 | 22.104 |
| 16.56 | 22.115 |
| 16.5645 | 22.124 |
| 16.569 | 22.133 |
| 16.5735 | 22.141 |
| 16.578 | 22.147 |
| 16.5825 | 22.153 |
| 16.587 | 22.159 |
| 16.5915 | 22.164 |
| 16.596 | 22.168 |
| 16.6005 | 22.172 |
| 16.605 | 22.175 |
| 16.6095 | 22.178 |
| 16.614 | 22.18 |
| 16.6185 | 22.182 |
| 16.623 | 22.185 |
| 16.6275 | 22.188 |
| 16.632 | 22.19 |
| 16.6365 | 22.193 |
| 16.641 | 22.196 |
| 16.6455 | 22.198 |
| 16.65 | 22.201 |
| 16.6545 | 22.203 |
| 16.659 | 22.206 |
| 16.6635 | 22.209 |
| 16.668 | 22.211 |
| 16.6725 | 22.214 |
| 16.677 | 22.216 |
| 16.6815 | 22.218 |
| 16.686 | 22.22 |
| 16.6905 | 22.221 |
| 16.695 | 22.223 |
| 16.6995 | 22.224 |
| 16.704 | 22.226 |
| 16.7085 | 22.228 |
| 16.713 | 22.229 |
| 16.7175 | 22.231 |
| 16.722 | 22.233 |
| 16.7265 | 22.235 |
| 16.731 | 22.237 |
| 16.7355 | 22.239 |
| 16.74 | 22.241 |
| 16.7445 | 22.244 |
| 16.749 | 22.247 |
| 16.7535 | 22.25 |
| 16.758 | 22.252 |
| 16.7625 | 22.254 |
| 16.767 | 22.255 |
| 16.7715 | 22.256 |
| 16.776 | 22.257 |
| 16.7805 | 22.258 |
| 16.785 | 22.258 |
| 16.7895 | 22.257 |
| 16.794 | 22.256 |
| 16.7985 | 22.253 |
| 16.803 | 22.25 |
| 16.8075 | 22.246 |
| 16.812 | 22.243 |
| 16.8165 | 22.24 |
| 16.821 | 22.237 |
| 16.8255 | 22.234 |
| 16.83 | 22.23 |
| 16.8345 | 22.227 |
| 16.839 | 22.225 |
| 16.8435 | 22.223 |
| 16.848 | 22.223 |
| 16.8525 | 22.224 |
| 16.857 | 22.225 |
| 16.8615 | 22.228 |
| 16.866 | 22.231 |
| 16.8705 | 22.235 |
| 16.875 | 22.239 |
| 16.8795 | 22.243 |
| 16.884 | 22.249 |
| 16.8885 | 22.255 |
| 16.893 | 22.261 |
| 16.8975 | 22.267 |
| 16.902 | 22.273 |
| 16.9065 | 22.278 |
| 16.911 | 22.282 |
| 16.9155 | 22.286 |
| 16.92 | 22.289 |
| 16.9245 | 22.292 |
| 16.929 | 22.295 |
| 16.9335 | 22.297 |
| 16.938 | 22.298 |
| 16.9425 | 22.298 |
| 16.947 | 22.298 |
| 16.9515 | 22.298 |
| 16.956 | 22.297 |
| 16.9605 | 22.297 |
| 16.965 | 22.298 |
| 16.9695 | 22.298 |
| 16.974 | 22.298 |
| 16.9785 | 22.299 |
| 16.983 | 22.3 |
| 16.9875 | 22.301 |
| 16.992 | 22.303 |
| 16.9965 | 22.306 |
| 17.001 | 22.309 |
| 17.0055 | 22.312 |
| 17.01 | 22.316 |
| 17.0145 | 22.321 |
| 17.019 | 22.325 |
| 17.0235 | 22.33 |
| 17.028 | 22.335 |
| 17.0325 | 22.341 |
| 17.037 | 22.347 |
| 17.0415 | 22.354 |
| 17.046 | 22.36 |
| 17.0505 | 22.367 |
| 17.055 | 22.374 |
| 17.0595 | 22.382 |
| 17.064 | 22.39 |
| 17.0685 | 22.398 |
| 17.073 | 22.406 |
| 17.0775 | 22.414 |
| 17.082 | 22.423 |
| 17.0865 | 22.432 |
| 17.091 | 22.441 |
| 17.0955 | 22.45 |
| 17.1 | 22.459 |
| 17.1045 | 22.468 |
| 17.109 | 22.476 |
| 17.1135 | 22.484 |
| 17.118 | 22.492 |
| 17.1225 | 22.5 |
| 17.127 | 22.507 |
| 17.1315 | 22.514 |
| 17.136 | 22.52 |
| 17.1405 | 22.525 |
| 17.145 | 22.529 |
| 17.1495 | 22.533 |
| 17.154 | 22.536 |
| 17.1585 | 22.539 |
| 17.163 | 22.542 |
| 17.1675 | 22.544 |
| 17.172 | 22.547 |
| 17.1765 | 22.548 |
| 17.181 | 22.55 |
| 17.1855 | 22.551 |
| 17.19 | 22.553 |
| 17.1945 | 22.555 |
| 17.199 | 22.558 |
| 17.2035 | 22.561 |
| 17.208 | 22.565 |
| 17.2125 | 22.568 |
| 17.217 | 22.572 |
| 17.2215 | 22.575 |
| 17.226 | 22.579 |
| 17.2305 | 22.583 |
| 17.235 | 22.586 |
| 17.2395 | 22.59 |
| 17.244 | 22.594 |
| 17.2485 | 22.597 |
| 17.253 | 22.6 |
| 17.2575 | 22.602 |
| 17.262 | 22.603 |
| 17.2665 | 22.603 |
| 17.271 | 22.604 |
| 17.2755 | 22.604 |
| 17.28 | 22.603 |
| 17.2845 | 22.602 |
| 17.289 | 22.601 |
| 17.2935 | 22.599 |
| 17.298 | 22.597 |
| 17.3025 | 22.594 |
| 17.307 | 22.592 |
| 17.3115 | 22.59 |
| 17.316 | 22.589 |
| 17.3205 | 22.588 |
| 17.325 | 22.587 |
| 17.3295 | 22.586 |
| 17.334 | 22.586 |
| 17.3385 | 22.586 |
| 17.343 | 22.587 |
| 17.3475 | 22.588 |
| 17.352 | 22.59 |
| 17.3565 | 22.593 |
| 17.361 | 22.596 |
| 17.3655 | 22.599 |
| 17.37 | 22.603 |
| 17.3745 | 22.607 |
| 17.379 | 22.612 |
| 17.3835 | 22.617 |
| 17.388 | 22.623 |
| 17.3925 | 22.629 |
| 17.397 | 22.636 |
| 17.4015 | 22.643 |
| 17.406 | 22.651 |
| 17.4105 | 22.66 |
| 17.415 | 22.67 |
| 17.4195 | 22.68 |
| 17.424 | 22.69 |
| 17.4285 | 22.702 |
| 17.433 | 22.713 |
| 17.4375 | 22.725 |
| 17.442 | 22.738 |
| 17.4465 | 22.752 |
| 17.451 | 22.766 |
| 17.4555 | 22.78 |
| 17.46 | 22.793 |
| 17.4645 | 22.806 |
| 17.469 | 22.817 |
| 17.4735 | 22.829 |
| 17.478 | 22.84 |
| 17.4825 | 22.851 |
| 17.487 | 22.86 |
| 17.4915 | 22.868 |
| 17.496 | 22.874 |
| 17.5005 | 22.878 |
| 17.505 | 22.88 |
| 17.5095 | 22.88 |
| 17.514 | 22.88 |
| 17.5185 | 22.878 |
| 17.523 | 22.876 |
| 17.5275 | 22.873 |
| 17.532 | 22.869 |
| 17.5365 | 22.863 |
| 17.541 | 22.857 |
| 17.5455 | 22.849 |
| 17.55 | 22.843 |
| 17.5545 | 22.837 |
| 17.559 | 22.833 |
| 17.5635 | 22.829 |
| 17.568 | 22.825 |
| 17.5725 | 22.822 |
| 17.577 | 22.82 |
| 17.5815 | 22.819 |
| 17.586 | 22.819 |
| 17.5905 | 22.82 |
| 17.595 | 22.823 |
| 17.5995 | 22.828 |
| 17.604 | 22.833 |
| 17.6085 | 22.839 |
| 17.613 | 22.846 |
| 17.6175 | 22.853 |
| 17.622 | 22.861 |
| 17.6265 | 22.869 |
| 17.631 | 22.878 |
| 17.6355 | 22.887 |
| 17.64 | 22.897 |
| 17.6445 | 22.907 |
| 17.649 | 22.916 |
| 17.6535 | 22.925 |
| 17.658 | 22.935 |
| 17.6625 | 22.944 |
| 17.667 | 22.953 |
| 17.6715 | 22.963 |
| 17.676 | 22.972 |
| 17.6805 | 22.981 |
| 17.685 | 22.99 |
| 17.6895 | 22.999 |
| 17.694 | 23.008 |
| 17.6985 | 23.017 |
| 17.703 | 23.025 |
| 17.7075 | 23.033 |
| 17.712 | 23.041 |
| 17.7165 | 23.048 |
| 17.721 | 23.055 |
| 17.7255 | 23.061 |
| 17.73 | 23.067 |
| 17.7345 | 23.073 |
| 17.739 | 23.077 |
| 17.7435 | 23.081 |
| 17.748 | 23.084 |
| 17.7525 | 23.085 |
| 17.757 | 23.086 |
| 17.7615 | 23.086 |
| 17.766 | 23.086 |
| 17.7705 | 23.085 |
| 17.775 | 23.084 |
| 17.7795 | 23.082 |
| 17.784 | 23.08 |
| 17.7885 | 23.077 |
| 17.793 | 23.074 |
| 17.7975 | 23.071 |
| 17.802 | 23.068 |
| 17.8065 | 23.066 |
| 17.811 | 23.065 |
| 17.8155 | 23.064 |
| 17.82 | 23.063 |
| 17.8245 | 23.063 |
| 17.829 | 23.063 |
| 17.8335 | 23.064 |
| 17.838 | 23.065 |
| 17.8425 | 23.067 |
| 17.847 | 23.07 |
| 17.8515 | 23.073 |
| 17.856 | 23.076 |
| 17.8605 | 23.08 |
| 17.865 | 23.083 |
| 17.8695 | 23.086 |
| 17.874 | 23.088 |
| 17.8785 | 23.091 |
| 17.883 | 23.093 |
| 17.8875 | 23.094 |
| 17.892 | 23.096 |
| 17.8965 | 23.097 |
| 17.901 | 23.097 |
| 17.9055 | 23.097 |
| 17.91 | 23.096 |
| 17.9145 | 23.094 |
| 17.919 | 23.092 |
| 17.9235 | 23.089 |
| 17.928 | 23.087 |
| 17.9325 | 23.084 |
| 17.937 | 23.082 |
| 17.9415 | 23.08 |
| 17.946 | 23.077 |
| 17.9505 | 23.075 |
| 17.955 | 23.072 |
| 17.9595 | 23.07 |
| 17.964 | 23.068 |
| 17.9685 | 23.067 |
| 17.973 | 23.066 |
| 17.9775 | 23.066 |
| 17.982 | 23.065 |
| 17.9865 | 23.065 |
| 17.991 | 23.066 |
| 17.9955 | 23.067 |
| 18.0 | 23.067 |
| 18.0045 | 23.069 |
| 18.009 | 23.07 |
| 18.0135 | 23.072 |
| 18.018 | 23.074 |
| 18.0225 | 23.076 |
| 18.027 | 23.078 |
| 18.0315 | 23.081 |
| 18.036 | 23.084 |
| 18.0405 | 23.088 |
| 18.045 | 23.091 |
| 18.0495 | 23.095 |
| 18.054 | 23.099 |
| 18.0585 | 23.103 |
| 18.063 | 23.108 |
| 18.0675 | 23.113 |
| 18.072 | 23.119 |
| 18.0765 | 23.125 |
| 18.081 | 23.131 |
| 18.0855 | 23.137 |
| 18.09 | 23.144 |
| 18.0945 | 23.15 |
| 18.099 | 23.157 |
| 18.1035 | 23.163 |
| 18.108 | 23.17 |
| 18.1125 | 23.177 |
| 18.117 | 23.184 |
| 18.1215 | 23.19 |
| 18.126 | 23.197 |
| 18.1305 | 23.203 |
| 18.135 | 23.208 |
| 18.1395 | 23.213 |
| 18.144 | 23.218 |
| 18.1485 | 23.223 |
| 18.153 | 23.228 |
| 18.1575 | 23.232 |
| 18.162 | 23.237 |
| 18.1665 | 23.242 |
| 18.171 | 23.246 |
| 18.1755 | 23.251 |
| 18.18 | 23.255 |
| 18.1845 | 23.26 |
| 18.189 | 23.264 |
| 18.1935 | 23.27 |
| 18.198 | 23.275 |
| 18.2025 | 23.282 |
| 18.207 | 23.289 |
| 18.2115 | 23.296 |
| 18.216 | 23.303 |
| 18.2205 | 23.311 |
| 18.225 | 23.318 |
| 18.2295 | 23.325 |
| 18.234 | 23.333 |
| 18.2385 | 23.34 |
| 18.243 | 23.348 |
| 18.2475 | 23.356 |
| 18.252 | 23.364 |
| 18.2565 | 23.371 |
| 18.261 | 23.377 |
| 18.2655 | 23.382 |
| 18.27 | 23.387 |
| 18.2745 | 23.391 |
| 18.279 | 23.394 |
| 18.2835 | 23.397 |
| 18.288 | 23.4 |
| 18.2925 | 23.402 |
| 18.297 | 23.404 |
| 18.3015 | 23.405 |
| 18.306 | 23.405 |
| 18.3105 | 23.405 |
| 18.315 | 23.404 |
| 18.3195 | 23.403 |
| 18.324 | 23.402 |
| 18.3285 | 23.402 |
| 18.333 | 23.402 |
| 18.3375 | 23.402 |
| 18.342 | 23.402 |
| 18.3465 | 23.403 |
| 18.351 | 23.403 |
| 18.3555 | 23.404 |
| 18.36 | 23.405 |
| 18.3645 | 23.407 |
| 18.369 | 23.409 |
| 18.3735 | 23.412 |
| 18.378 | 23.415 |
| 18.3825 | 23.418 |
| 18.387 | 23.422 |
| 18.3915 | 23.425 |
| 18.396 | 23.429 |
| 18.4005 | 23.434 |
| 18.405 | 23.438 |
| 18.4095 | 23.443 |
| 18.414 | 23.448 |
| 18.4185 | 23.453 |
| 18.423 | 23.459 |
| 18.4275 | 23.465 |
| 18.432 | 23.472 |
| 18.4365 | 23.479 |
| 18.441 | 23.486 |
| 18.4455 | 23.494 |
| 18.45 | 23.502 |
| 18.4545 | 23.51 |
| 18.459 | 23.519 |
| 18.4635 | 23.528 |
| 18.468 | 23.538 |
| 18.4725 | 23.549 |
| 18.477 | 23.56 |
| 18.4815 | 23.572 |
| 18.486 | 23.584 |
| 18.4905 | 23.595 |
| 18.495 | 23.607 |
| 18.4995 | 23.619 |
| 18.504 | 23.63 |
| 18.5085 | 23.642 |
| 18.513 | 23.654 |
| 18.5175 | 23.665 |
| 18.522 | 23.677 |
| 18.5265 | 23.687 |
| 18.531 | 23.698 |
| 18.5355 | 23.707 |
| 18.54 | 23.715 |
| 18.5445 | 23.723 |
| 18.549 | 23.73 |
| 18.5535 | 23.737 |
| 18.558 | 23.744 |
| 18.5625 | 23.75 |
| 18.567 | 23.756 |
| 18.5715 | 23.762 |
| 18.576 | 23.768 |
| 18.5805 | 23.773 |
| 18.585 | 23.777 |
| 18.5895 | 23.782 |
| 18.594 | 23.787 |
| 18.5985 | 23.792 |
| 18.603 | 23.798 |
| 18.6075 | 23.804 |
| 18.612 | 23.811 |
| 18.6165 | 23.818 |
| 18.621 | 23.825 |
| 18.6255 | 23.832 |
| 18.63 | 23.84 |
| 18.6345 | 23.847 |
| 18.639 | 23.854 |
| 18.6435 | 23.861 |
| 18.648 | 23.868 |
| 18.6525 | 23.875 |
| 18.657 | 23.883 |
| 18.6615 | 23.89 |
| 18.666 | 23.896 |
| 18.6705 | 23.901 |
| 18.675 | 23.906 |
| 18.6795 | 23.91 |
| 18.684 | 23.913 |
| 18.6885 | 23.915 |
| 18.693 | 23.918 |
| 18.6975 | 23.92 |
| 18.702 | 23.921 |
| 18.7065 | 23.923 |
| 18.711 | 23.924 |
| 18.7155 | 23.925 |
| 18.72 | 23.925 |
| 18.7245 | 23.926 |
| 18.729 | 23.926 |
| 18.7335 | 23.927 |
| 18.738 | 23.928 |
| 18.7425 | 23.93 |
| 18.747 | 23.933 |
| 18.7515 | 23.937 |
| 18.756 | 23.941 |
| 18.7605 | 23.945 |
| 18.765 | 23.95 |
| 18.7695 | 23.955 |
| 18.774 | 23.961 |
| 18.7785 | 23.966 |
| 18.783 | 23.973 |
| 18.7875 | 23.98 |
| 18.792 | 23.988 |
| 18.7965 | 23.996 |
| 18.801 | 24.003 |
| 18.8055 | 24.01 |
| 18.81 | 24.017 |
| 18.8145 | 24.023 |
| 18.819 | 24.028 |
| 18.8235 | 24.033 |
| 18.828 | 24.037 |
| 18.8325 | 24.041 |
| 18.837 | 24.045 |
| 18.8415 | 24.048 |
| 18.846 | 24.051 |
| 18.8505 | 24.053 |
| 18.855 | 24.054 |
| 18.8595 | 24.055 |
| 18.864 | 24.055 |
| 18.8685 | 24.055 |
| 18.873 | 24.055 |
| 18.8775 | 24.056 |
| 18.882 | 24.057 |
| 18.8865 | 24.059 |
| 18.891 | 24.061 |
| 18.8955 | 24.063 |
| 18.9 | 24.066 |
| 18.9045 | 24.069 |
| 18.909 | 24.073 |
| 18.9135 | 24.077 |
| 18.918 | 24.081 |
| 18.9225 | 24.086 |
| 18.927 | 24.093 |
| 18.9315 | 24.099 |
| 18.936 | 24.107 |
| 18.9405 | 24.114 |
| 18.945 | 24.122 |
| 18.9495 | 24.13 |
| 18.954 | 24.137 |
| 18.9585 | 24.144 |
| 18.963 | 24.152 |
| 18.9675 | 24.159 |
| 18.972 | 24.166 |
| 18.9765 | 24.173 |
| 18.981 | 24.181 |
| 18.9855 | 24.188 |
| 18.99 | 24.194 |
| 18.9945 | 24.201 |
| 18.999 | 24.207 |
| 19.0035 | 24.212 |
| 19.008 | 24.218 |
| 19.0125 | 24.223 |
| 19.017 | 24.229 |
| 19.0215 | 24.235 |
| 19.026 | 24.242 |
| 19.0305 | 24.249 |
| 19.035 | 24.256 |
| 19.0395 | 24.264 |
| 19.044 | 24.272 |
| 19.0485 | 24.281 |
| 19.053 | 24.289 |
| 19.0575 | 24.298 |
| 19.062 | 24.307 |
| 19.0665 | 24.317 |
| 19.071 | 24.327 |
| 19.0755 | 24.338 |
| 19.08 | 24.349 |
| 19.0845 | 24.361 |
| 19.089 | 24.372 |
| 19.0935 | 24.383 |
| 19.098 | 24.393 |
| 19.1025 | 24.402 |
| 19.107 | 24.412 |
| 19.1115 | 24.421 |
| 19.116 | 24.43 |
| 19.1205 | 24.439 |
| 19.125 | 24.447 |
| 19.1295 | 24.455 |
| 19.134 | 24.462 |
| 19.1385 | 24.468 |
| 19.143 | 24.474 |
| 19.1475 | 24.478 |
| 19.152 | 24.483 |
| 19.1565 | 24.486 |
| 19.161 | 24.49 |
| 19.1655 | 24.493 |
| 19.17 | 24.496 |
| 19.1745 | 24.499 |
| 19.179 | 24.502 |
| 19.1835 | 24.504 |
| 19.188 | 24.507 |
| 19.1925 | 24.509 |
| 19.197 | 24.511 |
| 19.2015 | 24.513 |
| 19.206 | 24.515 |
| 19.2105 | 24.517 |
| 19.215 | 24.519 |
| 19.2195 | 24.521 |
| 19.224 | 24.524 |
| 19.2285 | 24.526 |
| 19.233 | 24.528 |
| 19.2375 | 24.531 |
| 19.242 | 24.533 |
| 19.2465 | 24.536 |
| 19.251 | 24.539 |
| 19.2555 | 24.541 |
| 19.26 | 24.543 |
| 19.2645 | 24.546 |
| 19.269 | 24.549 |
| 19.2735 | 24.552 |
| 19.278 | 24.555 |
| 19.2825 | 24.56 |
| 19.287 | 24.565 |
| 19.2915 | 24.57 |
| 19.296 | 24.576 |
| 19.3005 | 24.582 |
| 19.305 | 24.589 |
| 19.3095 | 24.596 |
| 19.314 | 24.605 |
| 19.3185 | 24.615 |
| 19.323 | 24.626 |
| 19.3275 | 24.638 |
| 19.332 | 24.652 |
| 19.3365 | 24.666 |
| 19.341 | 24.682 |
| 19.3455 | 24.698 |
| 19.35 | 24.715 |
| 19.3545 | 24.732 |
| 19.359 | 24.749 |
| 19.3635 | 24.767 |
| 19.368 | 24.786 |
| 19.3725 | 24.806 |
| 19.377 | 24.827 |
| 19.3815 | 24.847 |
| 19.386 | 24.867 |
| 19.3905 | 24.886 |
| 19.395 | 24.904 |
| 19.3995 | 24.921 |
| 19.404 | 24.937 |
| 19.4085 | 24.953 |
| 19.413 | 24.968 |
| 19.4175 | 24.982 |
| 19.422 | 24.996 |
| 19.4265 | 25.008 |
| 19.431 | 25.02 |
| 19.4355 | 25.03 |
| 19.44 | 25.038 |
| 19.4445 | 25.045 |
| 19.449 | 25.051 |
| 19.4535 | 25.056 |
| 19.458 | 25.061 |
| 19.4625 | 25.065 |
| 19.467 | 25.068 |
| 19.4715 | 25.072 |
| 19.476 | 25.076 |
| 19.4805 | 25.079 |
| 19.485 | 25.081 |
| 19.4895 | 25.083 |
| 19.494 | 25.085 |
| 19.4985 | 25.087 |
| 19.503 | 25.089 |
| 19.5075 | 25.092 |
| 19.512 | 25.096 |
| 19.5165 | 25.1 |
| 19.521 | 25.104 |
| 19.5255 | 25.108 |
| 19.53 | 25.113 |
| 19.5345 | 25.118 |
| 19.539 | 25.124 |
| 19.5435 | 25.129 |
| 19.548 | 25.135 |
| 19.5525 | 25.142 |
| 19.557 | 25.148 |
| 19.5615 | 25.155 |
| 19.566 | 25.163 |
| 19.5705 | 25.171 |
| 19.575 | 25.178 |
| 19.5795 | 25.186 |
| 19.584 | 25.194 |
| 19.5885 | 25.203 |
| 19.593 | 25.211 |
| 19.5975 | 25.219 |
| 19.602 | 25.228 |
| 19.6065 | 25.237 |
| 19.611 | 25.246 |
| 19.6155 | 25.255 |
| 19.62 | 25.264 |
| 19.6245 | 25.274 |
| 19.629 | 25.284 |
| 19.6335 | 25.294 |
| 19.638 | 25.304 |
| 19.6425 | 25.315 |
| 19.647 | 25.325 |
| 19.6515 | 25.336 |
| 19.656 | 25.347 |
| 19.6605 | 25.357 |
| 19.665 | 25.368 |
| 19.6695 | 25.379 |
| 19.674 | 25.39 |
| 19.6785 | 25.401 |
| 19.683 | 25.412 |
| 19.6875 | 25.424 |
| 19.692 | 25.435 |
| 19.6965 | 25.446 |
| 19.701 | 25.457 |
| 19.7055 | 25.467 |
| 19.71 | 25.478 |
| 19.7145 | 25.488 |
| 19.719 | 25.498 |
| 19.7235 | 25.508 |
| 19.728 | 25.518 |
| 19.7325 | 25.529 |
| 19.737 | 25.539 |
| 19.7415 | 25.55 |
| 19.746 | 25.56 |
| 19.7505 | 25.571 |
| 19.755 | 25.581 |
| 19.7595 | 25.592 |
| 19.764 | 25.603 |
| 19.7685 | 25.614 |
| 19.773 | 25.625 |
| 19.7775 | 25.636 |
| 19.782 | 25.648 |
| 19.7865 | 25.66 |
| 19.791 | 25.672 |
| 19.7955 | 25.685 |
| 19.8 | 25.698 |
| 19.8045 | 25.71 |
| 19.809 | 25.722 |
| 19.8135 | 25.734 |
| 19.818 | 25.745 |
| 19.8225 | 25.755 |
| 19.827 | 25.766 |
| 19.8315 | 25.776 |
| 19.836 | 25.786 |
| 19.8405 | 25.795 |
| 19.845 | 25.804 |
| 19.8495 | 25.811 |
| 19.854 | 25.818 |
| 19.8585 | 25.823 |
| 19.863 | 25.827 |
| 19.8675 | 25.829 |
| 19.872 | 25.83 |
| 19.8765 | 25.831 |
| 19.881 | 25.83 |
| 19.8855 | 25.829 |
| 19.89 | 25.828 |
| 19.8945 | 25.827 |
| 19.899 | 25.826 |
| 19.9035 | 25.824 |
| 19.908 | 25.821 |
| 19.9125 | 25.817 |
| 19.917 | 25.813 |
| 19.9215 | 25.81 |
| 19.926 | 25.806 |
| 19.9305 | 25.804 |
| 19.935 | 25.804 |
| 19.9395 | 25.805 |
| 19.944 | 25.807 |
| 19.9485 | 25.81 |
| 19.953 | 25.814 |
| 19.9575 | 25.818 |
| 19.962 | 25.824 |
| 19.9665 | 25.831 |
| 19.971 | 25.839 |
| 19.9755 | 25.848 |
| 19.98 | 25.859 |
| 19.9845 | 25.871 |
| 19.989 | 25.885 |
| 19.9935 | 25.901 |
| 19.998 | 25.917 |
| 20.0025 | 25.934 |
| 20.007 | 25.951 |
| 20.0115 | 25.969 |
| 20.016 | 25.987 |
| 20.0205 | 26.005 |
| 20.025 | 26.024 |
| 20.0295 | 26.044 |
| 20.034 | 26.064 |
| 20.0385 | 26.084 |
| 20.043 | 26.104 |
| 20.0475 | 26.125 |
| 20.052 | 26.145 |
| 20.0565 | 26.166 |
| 20.061 | 26.185 |
| 20.0655 | 26.205 |
| 20.07 | 26.225 |
| 20.0745 | 26.245 |
| 20.079 | 26.264 |
| 20.0835 | 26.284 |
| 20.088 | 26.304 |
| 20.0925 | 26.323 |
| 20.097 | 26.343 |
| 20.1015 | 26.363 |
| 20.106 | 26.383 |
| 20.1105 | 26.403 |
| 20.115 | 26.423 |
| 20.1195 | 26.443 |
| 20.124 | 26.463 |
| 20.1285 | 26.482 |
| 20.133 | 26.502 |
| 20.1375 | 26.521 |
| 20.142 | 26.54 |
| 20.1465 | 26.559 |
| 20.151 | 26.578 |
| 20.1555 | 26.597 |
| 20.16 | 26.616 |
| 20.1645 | 26.634 |
| 20.169 | 26.652 |
| 20.1735 | 26.669 |
| 20.178 | 26.686 |
| 20.1825 | 26.702 |
| 20.187 | 26.716 |
| 20.1915 | 26.731 |
| 20.196 | 26.745 |
| 20.2005 | 26.758 |
| 20.205 | 26.771 |
| 20.2095 | 26.783 |
| 20.214 | 26.795 |
| 20.2185 | 26.807 |
| 20.223 | 26.818 |
| 20.2275 | 26.829 |
| 20.232 | 26.838 |
| 20.2365 | 26.848 |
| 20.241 | 26.857 |
| 20.2455 | 26.866 |
| 20.25 | 26.875 |
| 20.2545 | 26.884 |
| 20.259 | 26.894 |
| 20.2635 | 26.904 |
| 20.268 | 26.914 |
| 20.2725 | 26.924 |
| 20.277 | 26.935 |
| 20.2815 | 26.945 |
| 20.286 | 26.955 |
| 20.2905 | 26.966 |
| 20.295 | 26.976 |
| 20.2995 | 26.986 |
| 20.304 | 26.997 |
| 20.3085 | 27.007 |
| 20.313 | 27.018 |
| 20.3175 | 27.028 |
| 20.322 | 27.039 |
| 20.3265 | 27.049 |
| 20.331 | 27.059 |
| 20.3355 | 27.069 |
| 20.34 | 27.078 |
| 20.3445 | 27.086 |
| 20.349 | 27.093 |
| 20.3535 | 27.1 |
| 20.358 | 27.106 |
| 20.3625 | 27.112 |
| 20.367 | 27.117 |
| 20.3715 | 27.123 |
| 20.376 | 27.128 |
| 20.3805 | 27.133 |
| 20.385 | 27.139 |
| 20.3895 | 27.144 |
| 20.394 | 27.149 |
| 20.3985 | 27.153 |
| 20.403 | 27.158 |
| 20.4075 | 27.162 |
| 20.412 | 27.167 |
| 20.4165 | 27.173 |
| 20.421 | 27.18 |
| 20.4255 | 27.188 |
| 20.43 | 27.198 |
| 20.4345 | 27.209 |
| 20.439 | 27.22 |
| 20.4435 | 27.232 |
| 20.448 | 27.246 |
| 20.4525 | 27.26 |
| 20.457 | 27.275 |
| 20.4615 | 27.29 |
| 20.466 | 27.307 |
| 20.4705 | 27.325 |
| 20.475 | 27.344 |
| 20.4795 | 27.364 |
| 20.484 | 27.386 |
| 20.4885 | 27.408 |
| 20.493 | 27.431 |
| 20.4975 | 27.454 |
| 20.502 | 27.477 |
| 20.5065 | 27.5 |
| 20.511 | 27.522 |
| 20.5155 | 27.543 |
| 20.52 | 27.565 |
| 20.5245 | 27.587 |
| 20.529 | 27.609 |
| 20.5335 | 27.631 |
| 20.538 | 27.653 |
| 20.5425 | 27.673 |
| 20.547 | 27.693 |
| 20.5515 | 27.712 |
| 20.556 | 27.731 |
| 20.5605 | 27.748 |
| 20.565 | 27.764 |
| 20.5695 | 27.78 |
| 20.574 | 27.795 |
| 20.5785 | 27.81 |
| 20.583 | 27.824 |
| 20.5875 | 27.838 |
| 20.592 | 27.852 |
| 20.5965 | 27.866 |
| 20.601 | 27.879 |
| 20.6055 | 27.892 |
| 20.61 | 27.905 |
| 20.6145 | 27.917 |
| 20.619 | 27.929 |
| 20.6235 | 27.941 |
| 20.628 | 27.952 |
| 20.6325 | 27.964 |
| 20.637 | 27.976 |
| 20.6415 | 27.988 |
| 20.646 | 28 |
| 20.6505 | 28.012 |
| 20.655 | 28.025 |
| 20.6595 | 28.037 |
| 20.664 | 28.048 |
| 20.6685 | 28.06 |
| 20.673 | 28.072 |
| 20.6775 | 28.083 |
| 20.682 | 28.094 |
| 20.6865 | 28.105 |
| 20.691 | 28.116 |
| 20.6955 | 28.126 |
| 20.7 | 28.137 |
| 20.7045 | 28.147 |
| 20.709 | 28.157 |
| 20.7135 | 28.168 |
| 20.718 | 28.178 |
| 20.7225 | 28.189 |
| 20.727 | 28.2 |
| 20.7315 | 28.211 |
| 20.736 | 28.221 |
| 20.7405 | 28.232 |
| 20.745 | 28.243 |
| 20.7495 | 28.254 |
| 20.754 | 28.265 |
| 20.7585 | 28.278 |
| 20.763 | 28.291 |
| 20.7675 | 28.305 |
| 20.772 | 28.319 |
| 20.7765 | 28.335 |
| 20.781 | 28.351 |
| 20.7855 | 28.368 |
| 20.79 | 28.385 |
| 20.7945 | 28.402 |
| 20.799 | 28.42 |
| 20.8035 | 28.438 |
| 20.808 | 28.456 |
| 20.8125 | 28.475 |
| 20.817 | 28.494 |
| 20.8215 | 28.514 |
| 20.826 | 28.535 |
| 20.8305 | 28.555 |
| 20.835 | 28.576 |
| 20.8395 | 28.597 |
| 20.844 | 28.617 |
| 20.8485 | 28.636 |
| 20.853 | 28.654 |
| 20.8575 | 28.671 |
| 20.862 | 28.689 |
| 20.8665 | 28.706 |
| 20.871 | 28.722 |
| 20.8755 | 28.738 |
| 20.88 | 28.753 |
| 20.8845 | 28.768 |
| 20.889 | 28.782 |
| 20.8935 | 28.796 |
| 20.898 | 28.809 |
| 20.9025 | 28.821 |
| 20.907 | 28.832 |
| 20.9115 | 28.842 |
| 20.916 | 28.852 |
| 20.9205 | 28.862 |
| 20.925 | 28.871 |
| 20.9295 | 28.88 |
| 20.934 | 28.89 |
| 20.9385 | 28.9 |
| 20.943 | 28.91 |
| 20.9475 | 28.92 |
| 20.952 | 28.93 |
| 20.9565 | 28.94 |
| 20.961 | 28.951 |
| 20.9655 | 28.961 |
| 20.97 | 28.971 |
| 20.9745 | 28.982 |
| 20.979 | 28.993 |
| 20.9835 | 29.004 |
| 20.988 | 29.015 |
| 20.9925 | 29.027 |
| 20.997 | 29.04 |
| 21.0015 | 29.052 |
| 21.006 | 29.065 |
| 21.0105 | 29.078 |
| 21.015 | 29.091 |
| 21.0195 | 29.103 |
| 21.024 | 29.115 |
| 21.0285 | 29.127 |
| 21.033 | 29.138 |
| 21.0375 | 29.15 |
| 21.042 | 29.161 |
| 21.0465 | 29.171 |
| 21.051 | 29.182 |
| 21.0555 | 29.193 |
| 21.06 | 29.203 |
| 21.0645 | 29.213 |
| 21.069 | 29.223 |
| 21.0735 | 29.232 |
| 21.078 | 29.242 |
| 21.0825 | 29.25 |
| 21.087 | 29.258 |
| 21.0915 | 29.267 |
| 21.096 | 29.275 |
| 21.1005 | 29.283 |
| 21.105 | 29.291 |
| 21.1095 | 29.299 |
| 21.114 | 29.308 |
| 21.1185 | 29.318 |
| 21.123 | 29.328 |
| 21.1275 | 29.338 |
| 21.132 | 29.348 |
| 21.1365 | 29.358 |
| 21.141 | 29.369 |
| 21.1455 | 29.38 |
| 21.15 | 29.391 |
| 21.1545 | 29.402 |
| 21.159 | 29.413 |
| 21.1635 | 29.425 |
| 21.168 | 29.437 |
| 21.1725 | 29.449 |
| 21.177 | 29.462 |
| 21.1815 | 29.475 |
| 21.186 | 29.488 |
| 21.1905 | 29.501 |
| 21.195 | 29.514 |
| 21.1995 | 29.526 |
| 21.204 | 29.538 |
| 21.2085 | 29.55 |
| 21.213 | 29.562 |
| 21.2175 | 29.573 |
| 21.222 | 29.584 |
| 21.2265 | 29.595 |
| 21.231 | 29.605 |
| 21.2355 | 29.616 |
| 21.24 | 29.626 |
| 21.2445 | 29.637 |
| 21.249 | 29.647 |
| 21.2535 | 29.658 |
| 21.258 | 29.668 |
| 21.2625 | 29.678 |
| 21.267 | 29.689 |
| 21.2715 | 29.699 |
| 21.276 | 29.709 |
| 21.2805 | 29.719 |
| 21.285 | 29.729 |
| 21.2895 | 29.74 |
| 21.294 | 29.75 |
| 21.2985 | 29.761 |
| 21.303 | 29.773 |
| 21.3075 | 29.785 |
| 21.312 | 29.797 |
| 21.3165 | 29.81 |
| 21.321 | 29.822 |
| 21.3255 | 29.834 |
| 21.33 | 29.846 |
| 21.3345 | 29.857 |
| 21.339 | 29.868 |
| 21.3435 | 29.878 |
| 21.348 | 29.887 |
| 21.3525 | 29.896 |
| 21.357 | 29.905 |
| 21.3615 | 29.914 |
| 21.366 | 29.922 |
| 21.3705 | 29.929 |
| 21.375 | 29.935 |
| 21.3795 | 29.941 |
| 21.384 | 29.945 |
| 21.3885 | 29.948 |
| 21.393 | 29.95 |
| 21.3975 | 29.95 |
| 21.402 | 29.949 |
| 21.4065 | 29.947 |
| 21.411 | 29.945 |
| 21.4155 | 29.942 |
| 21.42 | 29.939 |
| 21.4245 | 29.936 |
| 21.429 | 29.933 |
| 21.4335 | 29.932 |
| 21.438 | 29.93 |
| 21.4425 | 29.928 |
| 21.447 | 29.925 |
| 21.4515 | 29.922 |
| 21.456 | 29.919 |
| 21.4605 | 29.917 |
| 21.465 | 29.916 |
| 21.4695 | 29.916 |
| 21.474 | 29.918 |
| 21.4785 | 29.922 |
| 21.483 | 29.929 |
| 21.4875 | 29.937 |
| 21.492 | 29.946 |
| 21.4965 | 29.957 |
| 21.501 | 29.969 |
| 21.5055 | 29.982 |
| 21.51 | 29.997 |
| 21.5145 | 30.012 |
| 21.519 | 30.029 |
| 21.5235 | 30.047 |
| 21.528 | 30.066 |
| 21.5325 | 30.087 |
| 21.537 | 30.11 |
| 21.5415 | 30.134 |
| 21.546 | 30.16 |
| 21.5505 | 30.186 |
| 21.555 | 30.213 |
| 21.5595 | 30.24 |
| 21.564 | 30.267 |
| 21.5685 | 30.294 |
| 21.573 | 30.32 |
| 21.5775 | 30.346 |
| 21.582 | 30.372 |
| 21.5865 | 30.398 |
| 21.591 | 30.424 |
| 21.5955 | 30.45 |
| 21.6 | 30.477 |
| 21.6045 | 30.503 |
| 21.609 | 30.53 |
| 21.6135 | 30.556 |
| 21.618 | 30.582 |
| 21.6225 | 30.608 |
| 21.627 | 30.633 |
| 21.6315 | 30.658 |
| 21.636 | 30.682 |
| 21.6405 | 30.707 |
| 21.645 | 30.732 |
| 21.6495 | 30.757 |
| 21.654 | 30.783 |
| 21.6585 | 30.809 |
| 21.663 | 30.837 |
| 21.6675 | 30.866 |
| 21.672 | 30.895 |
| 21.6765 | 30.926 |
| 21.681 | 30.957 |
| 21.6855 | 30.988 |
| 21.69 | 31.021 |
| 21.6945 | 31.053 |
| 21.699 | 31.086 |
| 21.7035 | 31.119 |
| 21.708 | 31.153 |
| 21.7125 | 31.186 |
| 21.717 | 31.22 |
| 21.7215 | 31.256 |
| 21.726 | 31.292 |
| 21.7305 | 31.329 |
| 21.735 | 31.366 |
| 21.7395 | 31.403 |
| 21.744 | 31.439 |
| 21.7485 | 31.473 |
| 21.753 | 31.507 |
| 21.7575 | 31.538 |
| 21.762 | 31.566 |
| 21.7665 | 31.594 |
| 21.771 | 31.621 |
| 21.7755 | 31.647 |
| 21.78 | 31.672 |
| 21.7845 | 31.695 |
| 21.789 | 31.717 |
| 21.7935 | 31.737 |
| 21.798 | 31.755 |
| 21.8025 | 31.771 |
| 21.807 | 31.784 |
| 21.8115 | 31.795 |
| 21.816 | 31.803 |
| 21.8205 | 31.809 |
| 21.825 | 31.813 |
| 21.8295 | 31.816 |
| 21.834 | 31.816 |
| 21.8385 | 31.816 |
| 21.843 | 31.815 |
| 21.8475 | 31.813 |
| 21.852 | 31.81 |
| 21.8565 | 31.808 |
| 21.861 | 31.804 |
| 21.8655 | 31.8 |
| 21.87 | 31.794 |
| 21.8745 | 31.787 |
| 21.879 | 31.78 |
| 21.8835 | 31.772 |
| 21.888 | 31.764 |
| 21.8925 | 31.756 |
| 21.897 | 31.747 |
| 21.9015 | 31.739 |
| 21.906 | 31.731 |
| 21.9105 | 31.723 |
| 21.915 | 31.716 |
| 21.9195 | 31.707 |
| 21.924 | 31.699 |
| 21.9285 | 31.691 |
| 21.933 | 31.682 |
| 21.9375 | 31.673 |
| 21.942 | 31.663 |
| 21.9465 | 31.653 |
| 21.951 | 31.642 |
| 21.9555 | 31.631 |
| 21.96 | 31.619 |
| 21.9645 | 31.607 |
| 21.969 | 31.594 |
| 21.9735 | 31.58 |
| 21.978 | 31.567 |
| 21.9825 | 31.553 |
| 21.987 | 31.539 |
| 21.9915 | 31.526 |
| 21.996 | 31.512 |
| 22.0005 | 31.499 |
| 22.005 | 31.486 |
| 22.0095 | 31.472 |
| 22.014 | 31.457 |
| 22.0185 | 31.443 |
| 22.023 | 31.428 |
| 22.0275 | 31.415 |
| 22.032 | 31.401 |
| 22.0365 | 31.389 |
| 22.041 | 31.378 |
| 22.0455 | 31.368 |
| 22.05 | 31.36 |
| 22.0545 | 31.353 |
| 22.059 | 31.347 |
| 22.0635 | 31.342 |
| 22.068 | 31.338 |
| 22.0725 | 31.335 |
| 22.077 | 31.333 |
| 22.0815 | 31.331 |
| 22.086 | 31.331 |
| 22.0905 | 31.33 |
| 22.095 | 31.331 |
| 22.0995 | 31.332 |
| 22.104 | 31.335 |
| 22.1085 | 31.339 |
| 22.113 | 31.344 |
| 22.1175 | 31.35 |
| 22.122 | 31.357 |
| 22.1265 | 31.363 |
| 22.131 | 31.37 |
| 22.1355 | 31.375 |
| 22.14 | 31.38 |
| 22.1445 | 31.384 |
| 22.149 | 31.387 |
| 22.1535 | 31.39 |
| 22.158 | 31.392 |
| 22.1625 | 31.394 |
| 22.167 | 31.396 |
| 22.1715 | 31.397 |
| 22.176 | 31.398 |
| 22.1805 | 31.398 |
| 22.185 | 31.398 |
| 22.1895 | 31.397 |
| 22.194 | 31.395 |
| 22.1985 | 31.392 |
| 22.203 | 31.388 |
| 22.2075 | 31.384 |
| 22.212 | 31.378 |
| 22.2165 | 31.372 |
| 22.221 | 31.365 |
| 22.2255 | 31.358 |
| 22.23 | 31.352 |
| 22.2345 | 31.346 |
| 22.239 | 31.34 |
| 22.2435 | 31.335 |
| 22.248 | 31.331 |
| 22.2525 | 31.326 |
| 22.257 | 31.322 |
| 22.2615 | 31.318 |
| 22.266 | 31.314 |
| 22.2705 | 31.31 |
| 22.275 | 31.307 |
| 22.2795 | 31.304 |
| 22.284 | 31.302 |
| 22.2885 | 31.3 |
| 22.293 | 31.299 |
| 22.2975 | 31.298 |
| 22.302 | 31.298 |
| 22.3065 | 31.299 |
| 22.311 | 31.301 |
| 22.3155 | 31.303 |
| 22.32 | 31.305 |
| 22.3245 | 31.308 |
| 22.329 | 31.31 |
| 22.3335 | 31.312 |
| 22.338 | 31.315 |
| 22.3425 | 31.316 |
| 22.347 | 31.318 |
| 22.3515 | 31.319 |
| 22.356 | 31.321 |
| 22.3605 | 31.322 |
| 22.365 | 31.323 |
| 22.3695 | 31.325 |
| 22.374 | 31.326 |
| 22.3785 | 31.327 |
| 22.383 | 31.328 |
| 22.3875 | 31.33 |
| 22.392 | 31.331 |
| 22.3965 | 31.332 |
| 22.401 | 31.333 |
| 22.4055 | 31.333 |
| 22.41 | 31.334 |
| 22.4145 | 31.334 |
| 22.419 | 31.335 |
| 22.4235 | 31.335 |
| 22.428 | 31.336 |
| 22.4325 | 31.338 |
| 22.437 | 31.34 |
| 22.4415 | 31.343 |
| 22.446 | 31.347 |
| 22.4505 | 31.351 |
| 22.455 | 31.357 |
| 22.4595 | 31.363 |
| 22.464 | 31.369 |
| 22.4685 | 31.376 |
| 22.473 | 31.383 |
| 22.4775 | 31.39 |
| 22.482 | 31.398 |
| 22.4865 | 31.405 |
| 22.491 | 31.412 |
| 22.4955 | 31.419 |
| 22.5 | 31.426 |
| 22.5045 | 31.434 |
| 22.509 | 31.442 |
| 22.5135 | 31.451 |
| 22.518 | 31.46 |
| 22.5225 | 31.468 |
| 22.527 | 31.475 |
| 22.5315 | 31.482 |
| 22.536 | 31.487 |
| 22.5405 | 31.49 |
| 22.545 | 31.492 |
| 22.5495 | 31.492 |
| 22.554 | 31.49 |
| 22.5585 | 31.488 |
| 22.563 | 31.485 |
| 22.5675 | 31.48 |
| 22.572 | 31.474 |
| 22.5765 | 31.468 |
| 22.581 | 31.46 |
| 22.5855 | 31.451 |
| 22.59 | 31.441 |
| 22.5945 | 31.43 |
| 22.599 | 31.418 |
| 22.6035 | 31.403 |
| 22.608 | 31.387 |
| 22.6125 | 31.37 |
| 22.617 | 31.352 |
| 22.6215 | 31.332 |
| 22.626 | 31.313 |
| 22.6305 | 31.293 |
| 22.635 | 31.273 |
| 22.6395 | 31.254 |
| 22.644 | 31.235 |
| 22.6485 | 31.218 |
| 22.653 | 31.2 |
| 22.6575 | 31.183 |
| 22.662 | 31.165 |
| 22.6665 | 31.148 |
| 22.671 | 31.13 |
| 22.6755 | 31.113 |
| 22.68 | 31.097 |
| 22.6845 | 31.081 |
| 22.689 | 31.065 |
| 22.6935 | 31.05 |
| 22.698 | 31.036 |
| 22.7025 | 31.023 |
| 22.707 | 31.011 |
| 22.7115 | 31 |
| 22.716 | 30.989 |
| 22.7205 | 30.979 |
| 22.725 | 30.969 |
| 22.7295 | 30.96 |
| 22.734 | 30.951 |
| 22.7385 | 30.941 |
| 22.743 | 30.932 |
| 22.7475 | 30.923 |
| 22.752 | 30.913 |
| 22.7565 | 30.903 |
| 22.761 | 30.893 |
| 22.7655 | 30.884 |
| 22.77 | 30.874 |
| 22.7745 | 30.864 |
| 22.779 | 30.855 |
| 22.7835 | 30.845 |
| 22.788 | 30.836 |
| 22.7925 | 30.827 |
| 22.797 | 30.818 |
| 22.8015 | 30.809 |
| 22.806 | 30.8 |
| 22.8105 | 30.791 |
| 22.815 | 30.781 |
| 22.8195 | 30.771 |
| 22.824 | 30.762 |
| 22.8285 | 30.753 |
| 22.833 | 30.744 |
| 22.8375 | 30.736 |
| 22.842 | 30.728 |
| 22.8465 | 30.722 |
| 22.851 | 30.717 |
| 22.8555 | 30.713 |
| 22.86 | 30.71 |
| 22.8645 | 30.707 |
| 22.869 | 30.706 |
| 22.8735 | 30.705 |
| 22.878 | 30.705 |
| 22.8825 | 30.706 |
| 22.887 | 30.707 |
| 22.8915 | 30.709 |
| 22.896 | 30.712 |
| 22.9005 | 30.715 |
| 22.905 | 30.719 |
| 22.9095 | 30.723 |
| 22.914 | 30.729 |
| 22.9185 | 30.736 |
| 22.923 | 30.744 |
| 22.9275 | 30.752 |
| 22.932 | 30.761 |
| 22.9365 | 30.77 |
| 22.941 | 30.779 |
| 22.9455 | 30.788 |
| 22.95 | 30.796 |
| 22.9545 | 30.804 |
| 22.959 | 30.81 |
| 22.9635 | 30.816 |
| 22.968 | 30.822 |
| 22.9725 | 30.827 |
| 22.977 | 30.832 |
| 22.9815 | 30.837 |
| 22.986 | 30.842 |
| 22.9905 | 30.846 |
| 22.995 | 30.849 |
| 22.9995 | 30.853 |
| 23.004 | 30.855 |
| 23.0085 | 30.858 |
| 23.013 | 30.859 |
| 23.0175 | 30.86 |
| 23.022 | 30.86 |
| 23.0265 | 30.86 |
| 23.031 | 30.859 |
| 23.0355 | 30.857 |
| 23.04 | 30.855 |
| 23.0445 | 30.854 |
| 23.049 | 30.852 |
| 23.0535 | 30.85 |
| 23.058 | 30.849 |
| 23.0625 | 30.849 |
| 23.067 | 30.849 |
| 23.0715 | 30.85 |
| 23.076 | 30.851 |
| 23.0805 | 30.853 |
| 23.085 | 30.854 |
| 23.0895 | 30.856 |
| 23.094 | 30.858 |
| 23.0985 | 30.86 |
| 23.103 | 30.862 |
| 23.1075 | 30.865 |
| 23.112 | 30.867 |
| 23.1165 | 30.869 |
| 23.121 | 30.872 |
| 23.1255 | 30.875 |
| 23.13 | 30.879 |
| 23.1345 | 30.883 |
| 23.139 | 30.888 |
| 23.1435 | 30.892 |
| 23.148 | 30.896 |
| 23.1525 | 30.9 |
| 23.157 | 30.903 |
| 23.1615 | 30.905 |
| 23.166 | 30.906 |
| 23.1705 | 30.905 |
| 23.175 | 30.903 |
| 23.1795 | 30.901 |
| 23.184 | 30.897 |
| 23.1885 | 30.893 |
| 23.193 | 30.887 |
| 23.1975 | 30.882 |
| 23.202 | 30.875 |
| 23.2065 | 30.867 |
| 23.211 | 30.859 |
| 23.2155 | 30.85 |
| 23.22 | 30.84 |
| 23.2245 | 30.83 |
| 23.229 | 30.818 |
| 23.2335 | 30.805 |
| 23.238 | 30.791 |
| 23.2425 | 30.775 |
| 23.247 | 30.759 |
| 23.2515 | 30.742 |
| 23.256 | 30.725 |
| 23.2605 | 30.707 |
| 23.265 | 30.69 |
| 23.2695 | 30.674 |
| 23.274 | 30.658 |
| 23.2785 | 30.643 |
| 23.283 | 30.63 |
| 23.2875 | 30.616 |
| 23.292 | 30.602 |
| 23.2965 | 30.588 |
| 23.301 | 30.575 |
| 23.3055 | 30.562 |
| 23.31 | 30.549 |
| 23.3145 | 30.537 |
| 23.319 | 30.526 |
| 23.3235 | 30.516 |
| 23.328 | 30.507 |
| 23.3325 | 30.5 |
| 23.337 | 30.493 |
| 23.3415 | 30.488 |
| 23.346 | 30.483 |
| 23.3505 | 30.48 |
| 23.355 | 30.478 |
| 23.3595 | 30.476 |
| 23.364 | 30.475 |
| 23.3685 | 30.475 |
| 23.373 | 30.475 |
| 23.3775 | 30.476 |
| 23.382 | 30.478 |
| 23.3865 | 30.48 |
| 23.391 | 30.482 |
| 23.3955 | 30.485 |
| 23.4 | 30.489 |
| 23.4045 | 30.493 |
| 23.409 | 30.498 |
| 23.4135 | 30.503 |
| 23.418 | 30.509 |
| 23.4225 | 30.516 |
| 23.427 | 30.523 |
| 23.4315 | 30.531 |
| 23.436 | 30.54 |
| 23.4405 | 30.549 |
| 23.445 | 30.559 |
| 23.4495 | 30.569 |
| 23.454 | 30.58 |
| 23.4585 | 30.591 |
| 23.463 | 30.603 |
| 23.4675 | 30.616 |
| 23.472 | 30.629 |
| 23.4765 | 30.643 |
| 23.481 | 30.657 |
| 23.4855 | 30.672 |
| 23.49 | 30.688 |
| 23.4945 | 30.704 |
| 23.499 | 30.721 |
| 23.5035 | 30.739 |
| 23.508 | 30.758 |
| 23.5125 | 30.779 |
| 23.517 | 30.801 |
| 23.5215 | 30.823 |
| 23.526 | 30.845 |
| 23.5305 | 30.868 |
| 23.535 | 30.89 |
| 23.5395 | 30.911 |
| 23.544 | 30.931 |
| 23.5485 | 30.95 |
| 23.553 | 30.967 |
| 23.5575 | 30.983 |
| 23.562 | 31 |
| 23.5665 | 31.016 |
| 23.571 | 31.033 |
| 23.5755 | 31.049 |
| 23.58 | 31.063 |
| 23.5845 | 31.077 |
| 23.589 | 31.088 |
| 23.5935 | 31.097 |
| 23.598 | 31.104 |
| 23.6025 | 31.107 |
| 23.607 | 31.107 |
| 23.6115 | 31.103 |
| 23.616 | 31.096 |
| 23.6205 | 31.086 |
| 23.625 | 31.073 |
| 23.6295 | 31.058 |
| 23.634 | 31.04 |
| 23.6385 | 31.02 |
| 23.643 | 30.998 |
| 23.6475 | 30.974 |
| 23.652 | 30.949 |
| 23.6565 | 30.921 |
| 23.661 | 30.892 |
| 23.6655 | 30.862 |
| 23.67 | 30.829 |
| 23.6745 | 30.793 |
| 23.679 | 30.754 |
| 23.6835 | 30.712 |
| 23.688 | 30.668 |
| 23.6925 | 30.623 |
| 23.697 | 30.578 |
| 23.7015 | 30.532 |
| 23.706 | 30.486 |
| 23.7105 | 30.441 |
| 23.715 | 30.398 |
| 23.7195 | 30.357 |
| 23.724 | 30.317 |
| 23.7285 | 30.278 |
| 23.733 | 30.239 |
| 23.7375 | 30.2 |
| 23.742 | 30.161 |
| 23.7465 | 30.122 |
| 23.751 | 30.085 |
| 23.7555 | 30.048 |
| 23.76 | 30.013 |
| 23.7645 | 29.98 |
| 23.769 | 29.948 |
| 23.7735 | 29.918 |
| 23.778 | 29.891 |
| 23.7825 | 29.866 |
| 23.787 | 29.843 |
| 23.7915 | 29.822 |
| 23.796 | 29.804 |
| 23.8005 | 29.787 |
| 23.805 | 29.771 |
| 23.8095 | 29.756 |
| 23.814 | 29.742 |
| 23.8185 | 29.728 |
| 23.823 | 29.714 |
| 23.8275 | 29.7 |
| 23.832 | 29.686 |
| 23.8365 | 29.671 |
| 23.841 | 29.657 |
| 23.8455 | 29.644 |
| 23.85 | 29.631 |
| 23.8545 | 29.619 |
| 23.859 | 29.606 |
| 23.8635 | 29.594 |
| 23.868 | 29.582 |
| 23.8725 | 29.57 |
| 23.877 | 29.557 |
| 23.8815 | 29.544 |
| 23.886 | 29.53 |
| 23.8905 | 29.514 |
| 23.895 | 29.498 |
| 23.8995 | 29.481 |
| 23.904 | 29.462 |
| 23.9085 | 29.443 |
| 23.913 | 29.423 |
| 23.9175 | 29.403 |
| 23.922 | 29.382 |
| 23.9265 | 29.362 |
| 23.931 | 29.343 |
| 23.9355 | 29.324 |
| 23.94 | 29.305 |
| 23.9445 | 29.288 |
| 23.949 | 29.273 |
| 23.9535 | 29.258 |
| 23.958 | 29.243 |
| 23.9625 | 29.229 |
| 23.967 | 29.216 |
| 23.9715 | 29.203 |
| 23.976 | 29.191 |
| 23.9805 | 29.179 |
| 23.985 | 29.169 |
| 23.9895 | 29.158 |
| 23.994 | 29.149 |
| 23.9985 | 29.141 |
| 24.003 | 29.133 |
| 24.0075 | 29.127 |
| 24.012 | 29.121 |
| 24.0165 | 29.117 |
| 24.021 | 29.115 |
| 24.0255 | 29.113 |
| 24.03 | 29.112 |
| 24.0345 | 29.111 |
| 24.039 | 29.111 |
| 24.0435 | 29.111 |
| 24.048 | 29.112 |
| 24.0525 | 29.112 |
| 24.057 | 29.112 |
| 24.0615 | 29.111 |
| 24.066 | 29.11 |
| 24.0705 | 29.109 |
| 24.075 | 29.108 |
| 24.0795 | 29.107 |
| 24.084 | 29.106 |
| 24.0885 | 29.105 |
| 24.093 | 29.104 |
| 24.0975 | 29.104 |
| 24.102 | 29.103 |
| 24.1065 | 29.102 |
| 24.111 | 29.101 |
| 24.1155 | 29.099 |
| 24.12 | 29.098 |
| 24.1245 | 29.097 |
| 24.129 | 29.095 |
| 24.1335 | 29.092 |
| 24.138 | 29.089 |
| 24.1425 | 29.085 |
| 24.147 | 29.082 |
| 24.1515 | 29.079 |
| 24.156 | 29.076 |
| 24.1605 | 29.074 |
| 24.165 | 29.072 |
| 24.1695 | 29.072 |
| 24.174 | 29.073 |
| 24.1785 | 29.075 |
| 24.183 | 29.078 |
| 24.1875 | 29.082 |
| 24.192 | 29.087 |
| 24.1965 | 29.093 |
| 24.201 | 29.099 |
| 24.2055 | 29.106 |
| 24.21 | 29.114 |
| 24.2145 | 29.123 |
| 24.219 | 29.132 |
| 24.2235 | 29.143 |
| 24.228 | 29.155 |
| 24.2325 | 29.168 |
| 24.237 | 29.181 |
| 24.2415 | 29.197 |
| 24.246 | 29.214 |
| 24.2505 | 29.232 |
| 24.255 | 29.252 |
| 24.2595 | 29.273 |
| 24.264 | 29.295 |
| 24.2685 | 29.318 |
| 24.273 | 29.341 |
| 24.2775 | 29.365 |
| 24.282 | 29.388 |
| 24.2865 | 29.411 |
| 24.291 | 29.434 |
| 24.2955 | 29.456 |
| 24.3 | 29.477 |
| 24.3045 | 29.498 |
| 24.309 | 29.52 |
| 24.3135 | 29.542 |
| 24.318 | 29.564 |
| 24.3225 | 29.586 |
| 24.327 | 29.608 |
| 24.3315 | 29.63 |
| 24.336 | 29.65 |
| 24.3405 | 29.67 |
| 24.345 | 29.689 |
| 24.3495 | 29.707 |
| 24.354 | 29.723 |
| 24.3585 | 29.738 |
| 24.363 | 29.752 |
| 24.3675 | 29.765 |
| 24.372 | 29.777 |
| 24.3765 | 29.788 |
| 24.381 | 29.798 |
| 24.3855 | 29.807 |
| 24.39 | 29.816 |
| 24.3945 | 29.823 |
| 24.399 | 29.83 |
| 24.4035 | 29.837 |
| 24.408 | 29.843 |
| 24.4125 | 29.848 |
| 24.417 | 29.853 |
| 24.4215 | 29.857 |
| 24.426 | 29.86 |
| 24.4305 | 29.863 |
| 24.435 | 29.866 |
| 24.4395 | 29.867 |
| 24.444 | 29.868 |
| 24.4485 | 29.868 |
| 24.453 | 29.868 |
| 24.4575 | 29.867 |
| 24.462 | 29.865 |
| 24.4665 | 29.862 |
| 24.471 | 29.859 |
| 24.4755 | 29.855 |
| 24.48 | 29.851 |
| 24.4845 | 29.846 |
| 24.489 | 29.84 |
| 24.4935 | 29.834 |
| 24.498 | 29.828 |
| 24.5025 | 29.82 |
| 24.507 | 29.812 |
| 24.5115 | 29.803 |
| 24.516 | 29.793 |
| 24.5205 | 29.782 |
| 24.525 | 29.77 |
| 24.5295 | 29.757 |
| 24.534 | 29.743 |
| 24.5385 | 29.728 |
| 24.543 | 29.71 |
| 24.5475 | 29.692 |
| 24.552 | 29.672 |
| 24.5565 | 29.651 |
| 24.561 | 29.629 |
| 24.5655 | 29.606 |
| 24.57 | 29.582 |
| 24.5745 | 29.558 |
| 24.579 | 29.533 |
| 24.5835 | 29.509 |
| 24.588 | 29.484 |
| 24.5925 | 29.459 |
| 24.597 | 29.435 |
| 24.6015 | 29.41 |
| 24.606 | 29.384 |
| 24.6105 | 29.357 |
| 24.615 | 29.329 |
| 24.6195 | 29.301 |
| 24.624 | 29.272 |
| 24.6285 | 29.244 |
| 24.633 | 29.216 |
| 24.6375 | 29.189 |
| 24.642 | 29.163 |
| 24.6465 | 29.138 |
| 24.651 | 29.114 |
| 24.6555 | 29.093 |
| 24.66 | 29.073 |
| 24.6645 | 29.054 |
| 24.669 | 29.036 |
| 24.6735 | 29.019 |
| 24.678 | 29.003 |
| 24.6825 | 28.989 |
| 24.687 | 28.974 |
| 24.6915 | 28.961 |
| 24.696 | 28.949 |
| 24.7005 | 28.937 |
| 24.705 | 28.926 |
| 24.7095 | 28.916 |
| 24.714 | 28.906 |
| 24.7185 | 28.896 |
| 24.723 | 28.888 |
| 24.7275 | 28.882 |
| 24.732 | 28.877 |
| 24.7365 | 28.873 |
| 24.741 | 28.87 |
| 24.7455 | 28.868 |
| 24.75 | 28.865 |
| 24.7545 | 28.863 |
| 24.759 | 28.861 |
| 24.7635 | 28.857 |
| 24.768 | 28.853 |
| 24.7725 | 28.848 |
| 24.777 | 28.841 |
| 24.7815 | 28.833 |
| 24.786 | 28.823 |
| 24.7905 | 28.814 |
| 24.795 | 28.804 |
| 24.7995 | 28.793 |
| 24.804 | 28.781 |
| 24.8085 | 28.769 |
| 24.813 | 28.757 |
| 24.8175 | 28.743 |
| 24.822 | 28.729 |
| 24.8265 | 28.713 |
| 24.831 | 28.697 |
| 24.8355 | 28.68 |
| 24.84 | 28.661 |
| 24.8445 | 28.641 |
| 24.849 | 28.62 |
| 24.8535 | 28.597 |
| 24.858 | 28.572 |
| 24.8625 | 28.546 |
| 24.867 | 28.519 |
| 24.8715 | 28.492 |
| 24.876 | 28.465 |
| 24.8805 | 28.437 |
| 24.885 | 28.41 |
| 24.8895 | 28.383 |
| 24.894 | 28.358 |
| 24.8985 | 28.333 |
| 24.903 | 28.31 |
| 24.9075 | 28.287 |
| 24.912 | 28.266 |
| 24.9165 | 28.245 |
| 24.921 | 28.225 |
| 24.9255 | 28.205 |
| 24.93 | 28.186 |
| 24.9345 | 28.167 |
| 24.939 | 28.148 |
| 24.9435 | 28.129 |
| 24.948 | 28.11 |
| 24.9525 | 28.092 |
| 24.957 | 28.073 |
| 24.9615 | 28.053 |
| 24.966 | 28.034 |